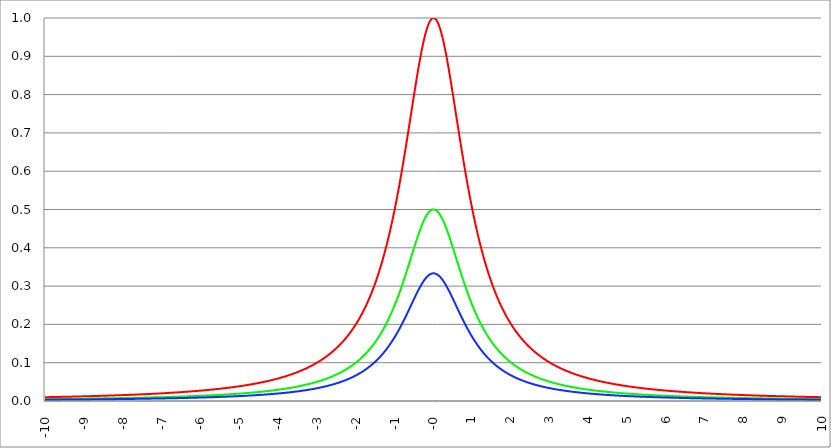
| Category | Series 1 | Series 0 | Series 2 |
|---|---|---|---|
| -10.0 | 0.01 | 0.005 | 0.003 |
| -9.99 | 0.01 | 0.005 | 0.003 |
| -9.98 | 0.01 | 0.005 | 0.003 |
| -9.97 | 0.01 | 0.005 | 0.003 |
| -9.96 | 0.01 | 0.005 | 0.003 |
| -9.95 | 0.01 | 0.005 | 0.003 |
| -9.940000000000001 | 0.01 | 0.005 | 0.003 |
| -9.930000000000001 | 0.01 | 0.005 | 0.003 |
| -9.920000000000002 | 0.01 | 0.005 | 0.003 |
| -9.91 | 0.01 | 0.005 | 0.003 |
| -9.900000000000002 | 0.01 | 0.005 | 0.003 |
| -9.890000000000002 | 0.01 | 0.005 | 0.003 |
| -9.880000000000003 | 0.01 | 0.005 | 0.003 |
| -9.870000000000003 | 0.01 | 0.005 | 0.003 |
| -9.860000000000001 | 0.01 | 0.005 | 0.003 |
| -9.850000000000003 | 0.01 | 0.005 | 0.003 |
| -9.840000000000003 | 0.01 | 0.005 | 0.003 |
| -9.830000000000004 | 0.01 | 0.005 | 0.003 |
| -9.820000000000004 | 0.01 | 0.005 | 0.003 |
| -9.810000000000004 | 0.01 | 0.005 | 0.003 |
| -9.800000000000004 | 0.01 | 0.005 | 0.003 |
| -9.790000000000004 | 0.01 | 0.005 | 0.003 |
| -9.780000000000005 | 0.01 | 0.005 | 0.003 |
| -9.770000000000005 | 0.01 | 0.005 | 0.003 |
| -9.760000000000005 | 0.01 | 0.005 | 0.003 |
| -9.750000000000005 | 0.01 | 0.005 | 0.003 |
| -9.740000000000006 | 0.01 | 0.005 | 0.003 |
| -9.730000000000006 | 0.01 | 0.005 | 0.003 |
| -9.720000000000006 | 0.01 | 0.005 | 0.003 |
| -9.710000000000006 | 0.01 | 0.005 | 0.003 |
| -9.700000000000006 | 0.011 | 0.005 | 0.004 |
| -9.690000000000007 | 0.011 | 0.005 | 0.004 |
| -9.680000000000007 | 0.011 | 0.005 | 0.004 |
| -9.670000000000007 | 0.011 | 0.005 | 0.004 |
| -9.660000000000007 | 0.011 | 0.005 | 0.004 |
| -9.650000000000007 | 0.011 | 0.005 | 0.004 |
| -9.640000000000008 | 0.011 | 0.005 | 0.004 |
| -9.630000000000008 | 0.011 | 0.005 | 0.004 |
| -9.620000000000008 | 0.011 | 0.005 | 0.004 |
| -9.610000000000008 | 0.011 | 0.005 | 0.004 |
| -9.600000000000009 | 0.011 | 0.005 | 0.004 |
| -9.590000000000009 | 0.011 | 0.005 | 0.004 |
| -9.580000000000007 | 0.011 | 0.005 | 0.004 |
| -9.57000000000001 | 0.011 | 0.005 | 0.004 |
| -9.56000000000001 | 0.011 | 0.005 | 0.004 |
| -9.55000000000001 | 0.011 | 0.005 | 0.004 |
| -9.54000000000001 | 0.011 | 0.005 | 0.004 |
| -9.53000000000001 | 0.011 | 0.005 | 0.004 |
| -9.52000000000001 | 0.011 | 0.005 | 0.004 |
| -9.51000000000001 | 0.011 | 0.005 | 0.004 |
| -9.50000000000001 | 0.011 | 0.005 | 0.004 |
| -9.49000000000001 | 0.011 | 0.005 | 0.004 |
| -9.48000000000001 | 0.011 | 0.006 | 0.004 |
| -9.47000000000001 | 0.011 | 0.006 | 0.004 |
| -9.46000000000001 | 0.011 | 0.006 | 0.004 |
| -9.45000000000001 | 0.011 | 0.006 | 0.004 |
| -9.44000000000001 | 0.011 | 0.006 | 0.004 |
| -9.430000000000012 | 0.011 | 0.006 | 0.004 |
| -9.420000000000012 | 0.011 | 0.006 | 0.004 |
| -9.410000000000013 | 0.011 | 0.006 | 0.004 |
| -9.400000000000013 | 0.011 | 0.006 | 0.004 |
| -9.390000000000011 | 0.011 | 0.006 | 0.004 |
| -9.380000000000013 | 0.011 | 0.006 | 0.004 |
| -9.370000000000013 | 0.011 | 0.006 | 0.004 |
| -9.360000000000014 | 0.011 | 0.006 | 0.004 |
| -9.350000000000014 | 0.011 | 0.006 | 0.004 |
| -9.340000000000014 | 0.011 | 0.006 | 0.004 |
| -9.330000000000014 | 0.011 | 0.006 | 0.004 |
| -9.320000000000014 | 0.011 | 0.006 | 0.004 |
| -9.310000000000015 | 0.011 | 0.006 | 0.004 |
| -9.300000000000013 | 0.011 | 0.006 | 0.004 |
| -9.290000000000015 | 0.011 | 0.006 | 0.004 |
| -9.280000000000015 | 0.011 | 0.006 | 0.004 |
| -9.270000000000016 | 0.012 | 0.006 | 0.004 |
| -9.260000000000016 | 0.012 | 0.006 | 0.004 |
| -9.250000000000014 | 0.012 | 0.006 | 0.004 |
| -9.240000000000016 | 0.012 | 0.006 | 0.004 |
| -9.230000000000016 | 0.012 | 0.006 | 0.004 |
| -9.220000000000017 | 0.012 | 0.006 | 0.004 |
| -9.210000000000017 | 0.012 | 0.006 | 0.004 |
| -9.200000000000017 | 0.012 | 0.006 | 0.004 |
| -9.190000000000017 | 0.012 | 0.006 | 0.004 |
| -9.180000000000017 | 0.012 | 0.006 | 0.004 |
| -9.170000000000018 | 0.012 | 0.006 | 0.004 |
| -9.160000000000016 | 0.012 | 0.006 | 0.004 |
| -9.150000000000018 | 0.012 | 0.006 | 0.004 |
| -9.140000000000018 | 0.012 | 0.006 | 0.004 |
| -9.130000000000019 | 0.012 | 0.006 | 0.004 |
| -9.120000000000019 | 0.012 | 0.006 | 0.004 |
| -9.110000000000017 | 0.012 | 0.006 | 0.004 |
| -9.10000000000002 | 0.012 | 0.006 | 0.004 |
| -9.09000000000002 | 0.012 | 0.006 | 0.004 |
| -9.08000000000002 | 0.012 | 0.006 | 0.004 |
| -9.07000000000002 | 0.012 | 0.006 | 0.004 |
| -9.06000000000002 | 0.012 | 0.006 | 0.004 |
| -9.05000000000002 | 0.012 | 0.006 | 0.004 |
| -9.04000000000002 | 0.012 | 0.006 | 0.004 |
| -9.03000000000002 | 0.012 | 0.006 | 0.004 |
| -9.020000000000021 | 0.012 | 0.006 | 0.004 |
| -9.010000000000021 | 0.012 | 0.006 | 0.004 |
| -9.000000000000021 | 0.012 | 0.006 | 0.004 |
| -8.990000000000022 | 0.012 | 0.006 | 0.004 |
| -8.980000000000022 | 0.012 | 0.006 | 0.004 |
| -8.97000000000002 | 0.012 | 0.006 | 0.004 |
| -8.960000000000022 | 0.012 | 0.006 | 0.004 |
| -8.950000000000022 | 0.012 | 0.006 | 0.004 |
| -8.940000000000023 | 0.012 | 0.006 | 0.004 |
| -8.930000000000023 | 0.012 | 0.006 | 0.004 |
| -8.920000000000023 | 0.012 | 0.006 | 0.004 |
| -8.910000000000023 | 0.012 | 0.006 | 0.004 |
| -8.900000000000023 | 0.012 | 0.006 | 0.004 |
| -8.890000000000024 | 0.012 | 0.006 | 0.004 |
| -8.880000000000024 | 0.013 | 0.006 | 0.004 |
| -8.870000000000024 | 0.013 | 0.006 | 0.004 |
| -8.860000000000024 | 0.013 | 0.006 | 0.004 |
| -8.850000000000025 | 0.013 | 0.006 | 0.004 |
| -8.840000000000025 | 0.013 | 0.006 | 0.004 |
| -8.830000000000025 | 0.013 | 0.006 | 0.004 |
| -8.820000000000025 | 0.013 | 0.006 | 0.004 |
| -8.810000000000025 | 0.013 | 0.006 | 0.004 |
| -8.800000000000026 | 0.013 | 0.006 | 0.004 |
| -8.790000000000026 | 0.013 | 0.006 | 0.004 |
| -8.780000000000026 | 0.013 | 0.006 | 0.004 |
| -8.770000000000026 | 0.013 | 0.006 | 0.004 |
| -8.760000000000026 | 0.013 | 0.006 | 0.004 |
| -8.750000000000027 | 0.013 | 0.006 | 0.004 |
| -8.740000000000027 | 0.013 | 0.006 | 0.004 |
| -8.730000000000027 | 0.013 | 0.006 | 0.004 |
| -8.720000000000027 | 0.013 | 0.006 | 0.004 |
| -8.710000000000027 | 0.013 | 0.007 | 0.004 |
| -8.700000000000028 | 0.013 | 0.007 | 0.004 |
| -8.690000000000028 | 0.013 | 0.007 | 0.004 |
| -8.680000000000028 | 0.013 | 0.007 | 0.004 |
| -8.670000000000028 | 0.013 | 0.007 | 0.004 |
| -8.660000000000029 | 0.013 | 0.007 | 0.004 |
| -8.650000000000029 | 0.013 | 0.007 | 0.004 |
| -8.640000000000029 | 0.013 | 0.007 | 0.004 |
| -8.63000000000003 | 0.013 | 0.007 | 0.004 |
| -8.62000000000003 | 0.013 | 0.007 | 0.004 |
| -8.61000000000003 | 0.013 | 0.007 | 0.004 |
| -8.60000000000003 | 0.013 | 0.007 | 0.004 |
| -8.59000000000003 | 0.013 | 0.007 | 0.004 |
| -8.58000000000003 | 0.013 | 0.007 | 0.004 |
| -8.57000000000003 | 0.013 | 0.007 | 0.004 |
| -8.56000000000003 | 0.013 | 0.007 | 0.004 |
| -8.55000000000003 | 0.013 | 0.007 | 0.004 |
| -8.540000000000031 | 0.014 | 0.007 | 0.005 |
| -8.530000000000031 | 0.014 | 0.007 | 0.005 |
| -8.520000000000032 | 0.014 | 0.007 | 0.005 |
| -8.510000000000032 | 0.014 | 0.007 | 0.005 |
| -8.50000000000003 | 0.014 | 0.007 | 0.005 |
| -8.490000000000032 | 0.014 | 0.007 | 0.005 |
| -8.480000000000032 | 0.014 | 0.007 | 0.005 |
| -8.470000000000033 | 0.014 | 0.007 | 0.005 |
| -8.460000000000033 | 0.014 | 0.007 | 0.005 |
| -8.450000000000033 | 0.014 | 0.007 | 0.005 |
| -8.440000000000033 | 0.014 | 0.007 | 0.005 |
| -8.430000000000033 | 0.014 | 0.007 | 0.005 |
| -8.420000000000034 | 0.014 | 0.007 | 0.005 |
| -8.410000000000032 | 0.014 | 0.007 | 0.005 |
| -8.400000000000034 | 0.014 | 0.007 | 0.005 |
| -8.390000000000034 | 0.014 | 0.007 | 0.005 |
| -8.380000000000035 | 0.014 | 0.007 | 0.005 |
| -8.370000000000035 | 0.014 | 0.007 | 0.005 |
| -8.360000000000033 | 0.014 | 0.007 | 0.005 |
| -8.350000000000035 | 0.014 | 0.007 | 0.005 |
| -8.340000000000035 | 0.014 | 0.007 | 0.005 |
| -8.330000000000036 | 0.014 | 0.007 | 0.005 |
| -8.320000000000036 | 0.014 | 0.007 | 0.005 |
| -8.310000000000034 | 0.014 | 0.007 | 0.005 |
| -8.300000000000036 | 0.014 | 0.007 | 0.005 |
| -8.290000000000036 | 0.014 | 0.007 | 0.005 |
| -8.280000000000037 | 0.014 | 0.007 | 0.005 |
| -8.270000000000037 | 0.014 | 0.007 | 0.005 |
| -8.260000000000037 | 0.014 | 0.007 | 0.005 |
| -8.250000000000037 | 0.014 | 0.007 | 0.005 |
| -8.240000000000038 | 0.015 | 0.007 | 0.005 |
| -8.230000000000038 | 0.015 | 0.007 | 0.005 |
| -8.220000000000038 | 0.015 | 0.007 | 0.005 |
| -8.210000000000038 | 0.015 | 0.007 | 0.005 |
| -8.200000000000038 | 0.015 | 0.007 | 0.005 |
| -8.190000000000039 | 0.015 | 0.007 | 0.005 |
| -8.180000000000039 | 0.015 | 0.007 | 0.005 |
| -8.170000000000037 | 0.015 | 0.007 | 0.005 |
| -8.16000000000004 | 0.015 | 0.007 | 0.005 |
| -8.15000000000004 | 0.015 | 0.007 | 0.005 |
| -8.14000000000004 | 0.015 | 0.007 | 0.005 |
| -8.13000000000004 | 0.015 | 0.007 | 0.005 |
| -8.12000000000004 | 0.015 | 0.007 | 0.005 |
| -8.11000000000004 | 0.015 | 0.007 | 0.005 |
| -8.10000000000004 | 0.015 | 0.008 | 0.005 |
| -8.09000000000004 | 0.015 | 0.008 | 0.005 |
| -8.08000000000004 | 0.015 | 0.008 | 0.005 |
| -8.07000000000004 | 0.015 | 0.008 | 0.005 |
| -8.06000000000004 | 0.015 | 0.008 | 0.005 |
| -8.05000000000004 | 0.015 | 0.008 | 0.005 |
| -8.040000000000042 | 0.015 | 0.008 | 0.005 |
| -8.03000000000004 | 0.015 | 0.008 | 0.005 |
| -8.020000000000042 | 0.015 | 0.008 | 0.005 |
| -8.010000000000042 | 0.015 | 0.008 | 0.005 |
| -8.000000000000043 | 0.015 | 0.008 | 0.005 |
| -7.990000000000043 | 0.015 | 0.008 | 0.005 |
| -7.980000000000043 | 0.015 | 0.008 | 0.005 |
| -7.970000000000043 | 0.015 | 0.008 | 0.005 |
| -7.960000000000043 | 0.016 | 0.008 | 0.005 |
| -7.950000000000044 | 0.016 | 0.008 | 0.005 |
| -7.940000000000044 | 0.016 | 0.008 | 0.005 |
| -7.930000000000044 | 0.016 | 0.008 | 0.005 |
| -7.920000000000044 | 0.016 | 0.008 | 0.005 |
| -7.910000000000044 | 0.016 | 0.008 | 0.005 |
| -7.900000000000044 | 0.016 | 0.008 | 0.005 |
| -7.890000000000045 | 0.016 | 0.008 | 0.005 |
| -7.880000000000045 | 0.016 | 0.008 | 0.005 |
| -7.870000000000045 | 0.016 | 0.008 | 0.005 |
| -7.860000000000046 | 0.016 | 0.008 | 0.005 |
| -7.850000000000046 | 0.016 | 0.008 | 0.005 |
| -7.840000000000046 | 0.016 | 0.008 | 0.005 |
| -7.830000000000046 | 0.016 | 0.008 | 0.005 |
| -7.820000000000046 | 0.016 | 0.008 | 0.005 |
| -7.810000000000047 | 0.016 | 0.008 | 0.005 |
| -7.800000000000047 | 0.016 | 0.008 | 0.005 |
| -7.790000000000047 | 0.016 | 0.008 | 0.005 |
| -7.780000000000047 | 0.016 | 0.008 | 0.005 |
| -7.770000000000047 | 0.016 | 0.008 | 0.005 |
| -7.760000000000048 | 0.016 | 0.008 | 0.005 |
| -7.750000000000048 | 0.016 | 0.008 | 0.005 |
| -7.740000000000048 | 0.016 | 0.008 | 0.005 |
| -7.730000000000048 | 0.016 | 0.008 | 0.005 |
| -7.720000000000049 | 0.017 | 0.008 | 0.006 |
| -7.710000000000049 | 0.017 | 0.008 | 0.006 |
| -7.700000000000049 | 0.017 | 0.008 | 0.006 |
| -7.690000000000049 | 0.017 | 0.008 | 0.006 |
| -7.680000000000049 | 0.017 | 0.008 | 0.006 |
| -7.67000000000005 | 0.017 | 0.008 | 0.006 |
| -7.66000000000005 | 0.017 | 0.008 | 0.006 |
| -7.65000000000005 | 0.017 | 0.008 | 0.006 |
| -7.64000000000005 | 0.017 | 0.008 | 0.006 |
| -7.63000000000005 | 0.017 | 0.008 | 0.006 |
| -7.620000000000051 | 0.017 | 0.008 | 0.006 |
| -7.610000000000051 | 0.017 | 0.008 | 0.006 |
| -7.600000000000051 | 0.017 | 0.009 | 0.006 |
| -7.590000000000051 | 0.017 | 0.009 | 0.006 |
| -7.580000000000052 | 0.017 | 0.009 | 0.006 |
| -7.570000000000052 | 0.017 | 0.009 | 0.006 |
| -7.560000000000052 | 0.017 | 0.009 | 0.006 |
| -7.550000000000052 | 0.017 | 0.009 | 0.006 |
| -7.540000000000052 | 0.017 | 0.009 | 0.006 |
| -7.530000000000053 | 0.017 | 0.009 | 0.006 |
| -7.520000000000053 | 0.017 | 0.009 | 0.006 |
| -7.510000000000053 | 0.017 | 0.009 | 0.006 |
| -7.500000000000053 | 0.017 | 0.009 | 0.006 |
| -7.490000000000053 | 0.018 | 0.009 | 0.006 |
| -7.480000000000054 | 0.018 | 0.009 | 0.006 |
| -7.470000000000054 | 0.018 | 0.009 | 0.006 |
| -7.460000000000054 | 0.018 | 0.009 | 0.006 |
| -7.450000000000054 | 0.018 | 0.009 | 0.006 |
| -7.440000000000054 | 0.018 | 0.009 | 0.006 |
| -7.430000000000054 | 0.018 | 0.009 | 0.006 |
| -7.420000000000055 | 0.018 | 0.009 | 0.006 |
| -7.410000000000055 | 0.018 | 0.009 | 0.006 |
| -7.400000000000055 | 0.018 | 0.009 | 0.006 |
| -7.390000000000056 | 0.018 | 0.009 | 0.006 |
| -7.380000000000056 | 0.018 | 0.009 | 0.006 |
| -7.370000000000056 | 0.018 | 0.009 | 0.006 |
| -7.360000000000056 | 0.018 | 0.009 | 0.006 |
| -7.350000000000056 | 0.018 | 0.009 | 0.006 |
| -7.340000000000057 | 0.018 | 0.009 | 0.006 |
| -7.330000000000057 | 0.018 | 0.009 | 0.006 |
| -7.320000000000057 | 0.018 | 0.009 | 0.006 |
| -7.310000000000057 | 0.018 | 0.009 | 0.006 |
| -7.300000000000058 | 0.018 | 0.009 | 0.006 |
| -7.290000000000058 | 0.018 | 0.009 | 0.006 |
| -7.280000000000058 | 0.019 | 0.009 | 0.006 |
| -7.270000000000058 | 0.019 | 0.009 | 0.006 |
| -7.260000000000058 | 0.019 | 0.009 | 0.006 |
| -7.250000000000059 | 0.019 | 0.009 | 0.006 |
| -7.240000000000059 | 0.019 | 0.009 | 0.006 |
| -7.23000000000006 | 0.019 | 0.009 | 0.006 |
| -7.220000000000059 | 0.019 | 0.009 | 0.006 |
| -7.210000000000059 | 0.019 | 0.009 | 0.006 |
| -7.20000000000006 | 0.019 | 0.009 | 0.006 |
| -7.19000000000006 | 0.019 | 0.009 | 0.006 |
| -7.18000000000006 | 0.019 | 0.01 | 0.006 |
| -7.17000000000006 | 0.019 | 0.01 | 0.006 |
| -7.160000000000061 | 0.019 | 0.01 | 0.006 |
| -7.150000000000061 | 0.019 | 0.01 | 0.006 |
| -7.140000000000061 | 0.019 | 0.01 | 0.006 |
| -7.130000000000061 | 0.019 | 0.01 | 0.006 |
| -7.120000000000061 | 0.019 | 0.01 | 0.006 |
| -7.110000000000062 | 0.019 | 0.01 | 0.006 |
| -7.100000000000062 | 0.019 | 0.01 | 0.006 |
| -7.090000000000062 | 0.02 | 0.01 | 0.007 |
| -7.080000000000062 | 0.02 | 0.01 | 0.007 |
| -7.070000000000062 | 0.02 | 0.01 | 0.007 |
| -7.060000000000063 | 0.02 | 0.01 | 0.007 |
| -7.050000000000063 | 0.02 | 0.01 | 0.007 |
| -7.040000000000063 | 0.02 | 0.01 | 0.007 |
| -7.030000000000063 | 0.02 | 0.01 | 0.007 |
| -7.020000000000064 | 0.02 | 0.01 | 0.007 |
| -7.010000000000064 | 0.02 | 0.01 | 0.007 |
| -7.000000000000064 | 0.02 | 0.01 | 0.007 |
| -6.990000000000064 | 0.02 | 0.01 | 0.007 |
| -6.980000000000064 | 0.02 | 0.01 | 0.007 |
| -6.970000000000064 | 0.02 | 0.01 | 0.007 |
| -6.960000000000064 | 0.02 | 0.01 | 0.007 |
| -6.950000000000064 | 0.02 | 0.01 | 0.007 |
| -6.940000000000065 | 0.02 | 0.01 | 0.007 |
| -6.930000000000065 | 0.02 | 0.01 | 0.007 |
| -6.920000000000065 | 0.02 | 0.01 | 0.007 |
| -6.910000000000065 | 0.021 | 0.01 | 0.007 |
| -6.900000000000066 | 0.021 | 0.01 | 0.007 |
| -6.890000000000066 | 0.021 | 0.01 | 0.007 |
| -6.880000000000066 | 0.021 | 0.01 | 0.007 |
| -6.870000000000066 | 0.021 | 0.01 | 0.007 |
| -6.860000000000067 | 0.021 | 0.01 | 0.007 |
| -6.850000000000067 | 0.021 | 0.01 | 0.007 |
| -6.840000000000067 | 0.021 | 0.01 | 0.007 |
| -6.830000000000067 | 0.021 | 0.01 | 0.007 |
| -6.820000000000068 | 0.021 | 0.011 | 0.007 |
| -6.810000000000068 | 0.021 | 0.011 | 0.007 |
| -6.800000000000068 | 0.021 | 0.011 | 0.007 |
| -6.790000000000068 | 0.021 | 0.011 | 0.007 |
| -6.780000000000068 | 0.021 | 0.011 | 0.007 |
| -6.770000000000068 | 0.021 | 0.011 | 0.007 |
| -6.760000000000069 | 0.021 | 0.011 | 0.007 |
| -6.75000000000007 | 0.021 | 0.011 | 0.007 |
| -6.74000000000007 | 0.022 | 0.011 | 0.007 |
| -6.73000000000007 | 0.022 | 0.011 | 0.007 |
| -6.72000000000007 | 0.022 | 0.011 | 0.007 |
| -6.71000000000007 | 0.022 | 0.011 | 0.007 |
| -6.70000000000007 | 0.022 | 0.011 | 0.007 |
| -6.69000000000007 | 0.022 | 0.011 | 0.007 |
| -6.680000000000071 | 0.022 | 0.011 | 0.007 |
| -6.670000000000071 | 0.022 | 0.011 | 0.007 |
| -6.660000000000071 | 0.022 | 0.011 | 0.007 |
| -6.650000000000071 | 0.022 | 0.011 | 0.007 |
| -6.640000000000072 | 0.022 | 0.011 | 0.007 |
| -6.630000000000072 | 0.022 | 0.011 | 0.007 |
| -6.620000000000072 | 0.022 | 0.011 | 0.007 |
| -6.610000000000072 | 0.022 | 0.011 | 0.007 |
| -6.600000000000072 | 0.022 | 0.011 | 0.007 |
| -6.590000000000073 | 0.023 | 0.011 | 0.008 |
| -6.580000000000073 | 0.023 | 0.011 | 0.008 |
| -6.570000000000073 | 0.023 | 0.011 | 0.008 |
| -6.560000000000073 | 0.023 | 0.011 | 0.008 |
| -6.550000000000074 | 0.023 | 0.011 | 0.008 |
| -6.540000000000074 | 0.023 | 0.011 | 0.008 |
| -6.530000000000074 | 0.023 | 0.011 | 0.008 |
| -6.520000000000074 | 0.023 | 0.011 | 0.008 |
| -6.510000000000074 | 0.023 | 0.012 | 0.008 |
| -6.500000000000074 | 0.023 | 0.012 | 0.008 |
| -6.490000000000074 | 0.023 | 0.012 | 0.008 |
| -6.480000000000074 | 0.023 | 0.012 | 0.008 |
| -6.470000000000075 | 0.023 | 0.012 | 0.008 |
| -6.460000000000075 | 0.023 | 0.012 | 0.008 |
| -6.450000000000075 | 0.023 | 0.012 | 0.008 |
| -6.440000000000075 | 0.024 | 0.012 | 0.008 |
| -6.430000000000076 | 0.024 | 0.012 | 0.008 |
| -6.420000000000076 | 0.024 | 0.012 | 0.008 |
| -6.410000000000076 | 0.024 | 0.012 | 0.008 |
| -6.400000000000076 | 0.024 | 0.012 | 0.008 |
| -6.390000000000077 | 0.024 | 0.012 | 0.008 |
| -6.380000000000077 | 0.024 | 0.012 | 0.008 |
| -6.370000000000077 | 0.024 | 0.012 | 0.008 |
| -6.360000000000078 | 0.024 | 0.012 | 0.008 |
| -6.350000000000078 | 0.024 | 0.012 | 0.008 |
| -6.340000000000078 | 0.024 | 0.012 | 0.008 |
| -6.330000000000078 | 0.024 | 0.012 | 0.008 |
| -6.320000000000078 | 0.024 | 0.012 | 0.008 |
| -6.310000000000079 | 0.025 | 0.012 | 0.008 |
| -6.300000000000079 | 0.025 | 0.012 | 0.008 |
| -6.29000000000008 | 0.025 | 0.012 | 0.008 |
| -6.28000000000008 | 0.025 | 0.012 | 0.008 |
| -6.27000000000008 | 0.025 | 0.012 | 0.008 |
| -6.26000000000008 | 0.025 | 0.012 | 0.008 |
| -6.25000000000008 | 0.025 | 0.012 | 0.008 |
| -6.24000000000008 | 0.025 | 0.013 | 0.008 |
| -6.23000000000008 | 0.025 | 0.013 | 0.008 |
| -6.220000000000081 | 0.025 | 0.013 | 0.008 |
| -6.210000000000081 | 0.025 | 0.013 | 0.008 |
| -6.200000000000081 | 0.025 | 0.013 | 0.008 |
| -6.190000000000081 | 0.025 | 0.013 | 0.008 |
| -6.180000000000081 | 0.026 | 0.013 | 0.009 |
| -6.170000000000082 | 0.026 | 0.013 | 0.009 |
| -6.160000000000082 | 0.026 | 0.013 | 0.009 |
| -6.150000000000082 | 0.026 | 0.013 | 0.009 |
| -6.140000000000082 | 0.026 | 0.013 | 0.009 |
| -6.130000000000082 | 0.026 | 0.013 | 0.009 |
| -6.120000000000083 | 0.026 | 0.013 | 0.009 |
| -6.110000000000083 | 0.026 | 0.013 | 0.009 |
| -6.100000000000083 | 0.026 | 0.013 | 0.009 |
| -6.090000000000083 | 0.026 | 0.013 | 0.009 |
| -6.080000000000084 | 0.026 | 0.013 | 0.009 |
| -6.070000000000084 | 0.026 | 0.013 | 0.009 |
| -6.060000000000084 | 0.027 | 0.013 | 0.009 |
| -6.050000000000084 | 0.027 | 0.013 | 0.009 |
| -6.040000000000084 | 0.027 | 0.013 | 0.009 |
| -6.030000000000084 | 0.027 | 0.013 | 0.009 |
| -6.020000000000085 | 0.027 | 0.013 | 0.009 |
| -6.010000000000085 | 0.027 | 0.013 | 0.009 |
| -6.000000000000085 | 0.027 | 0.014 | 0.009 |
| -5.990000000000085 | 0.027 | 0.014 | 0.009 |
| -5.980000000000085 | 0.027 | 0.014 | 0.009 |
| -5.970000000000085 | 0.027 | 0.014 | 0.009 |
| -5.960000000000086 | 0.027 | 0.014 | 0.009 |
| -5.950000000000086 | 0.027 | 0.014 | 0.009 |
| -5.940000000000086 | 0.028 | 0.014 | 0.009 |
| -5.930000000000086 | 0.028 | 0.014 | 0.009 |
| -5.920000000000087 | 0.028 | 0.014 | 0.009 |
| -5.910000000000087 | 0.028 | 0.014 | 0.009 |
| -5.900000000000087 | 0.028 | 0.014 | 0.009 |
| -5.890000000000088 | 0.028 | 0.014 | 0.009 |
| -5.880000000000088 | 0.028 | 0.014 | 0.009 |
| -5.870000000000088 | 0.028 | 0.014 | 0.009 |
| -5.860000000000088 | 0.028 | 0.014 | 0.009 |
| -5.850000000000088 | 0.028 | 0.014 | 0.009 |
| -5.840000000000089 | 0.028 | 0.014 | 0.009 |
| -5.830000000000089 | 0.029 | 0.014 | 0.01 |
| -5.820000000000089 | 0.029 | 0.014 | 0.01 |
| -5.810000000000089 | 0.029 | 0.014 | 0.01 |
| -5.800000000000089 | 0.029 | 0.014 | 0.01 |
| -5.79000000000009 | 0.029 | 0.014 | 0.01 |
| -5.78000000000009 | 0.029 | 0.015 | 0.01 |
| -5.77000000000009 | 0.029 | 0.015 | 0.01 |
| -5.76000000000009 | 0.029 | 0.015 | 0.01 |
| -5.750000000000091 | 0.029 | 0.015 | 0.01 |
| -5.740000000000091 | 0.029 | 0.015 | 0.01 |
| -5.730000000000091 | 0.03 | 0.015 | 0.01 |
| -5.720000000000091 | 0.03 | 0.015 | 0.01 |
| -5.710000000000091 | 0.03 | 0.015 | 0.01 |
| -5.700000000000092 | 0.03 | 0.015 | 0.01 |
| -5.690000000000092 | 0.03 | 0.015 | 0.01 |
| -5.680000000000092 | 0.03 | 0.015 | 0.01 |
| -5.670000000000092 | 0.03 | 0.015 | 0.01 |
| -5.660000000000092 | 0.03 | 0.015 | 0.01 |
| -5.650000000000093 | 0.03 | 0.015 | 0.01 |
| -5.640000000000093 | 0.03 | 0.015 | 0.01 |
| -5.630000000000093 | 0.031 | 0.015 | 0.01 |
| -5.620000000000093 | 0.031 | 0.015 | 0.01 |
| -5.610000000000093 | 0.031 | 0.015 | 0.01 |
| -5.600000000000094 | 0.031 | 0.015 | 0.01 |
| -5.590000000000094 | 0.031 | 0.016 | 0.01 |
| -5.580000000000094 | 0.031 | 0.016 | 0.01 |
| -5.570000000000094 | 0.031 | 0.016 | 0.01 |
| -5.560000000000095 | 0.031 | 0.016 | 0.01 |
| -5.550000000000095 | 0.031 | 0.016 | 0.01 |
| -5.540000000000095 | 0.032 | 0.016 | 0.011 |
| -5.530000000000095 | 0.032 | 0.016 | 0.011 |
| -5.520000000000095 | 0.032 | 0.016 | 0.011 |
| -5.510000000000096 | 0.032 | 0.016 | 0.011 |
| -5.500000000000096 | 0.032 | 0.016 | 0.011 |
| -5.490000000000096 | 0.032 | 0.016 | 0.011 |
| -5.480000000000096 | 0.032 | 0.016 | 0.011 |
| -5.470000000000096 | 0.032 | 0.016 | 0.011 |
| -5.460000000000097 | 0.032 | 0.016 | 0.011 |
| -5.450000000000097 | 0.033 | 0.016 | 0.011 |
| -5.440000000000097 | 0.033 | 0.016 | 0.011 |
| -5.430000000000097 | 0.033 | 0.016 | 0.011 |
| -5.420000000000098 | 0.033 | 0.016 | 0.011 |
| -5.410000000000098 | 0.033 | 0.017 | 0.011 |
| -5.400000000000098 | 0.033 | 0.017 | 0.011 |
| -5.390000000000098 | 0.033 | 0.017 | 0.011 |
| -5.380000000000098 | 0.033 | 0.017 | 0.011 |
| -5.370000000000099 | 0.034 | 0.017 | 0.011 |
| -5.360000000000099 | 0.034 | 0.017 | 0.011 |
| -5.350000000000099 | 0.034 | 0.017 | 0.011 |
| -5.340000000000099 | 0.034 | 0.017 | 0.011 |
| -5.330000000000099 | 0.034 | 0.017 | 0.011 |
| -5.3200000000001 | 0.034 | 0.017 | 0.011 |
| -5.3100000000001 | 0.034 | 0.017 | 0.011 |
| -5.3000000000001 | 0.034 | 0.017 | 0.011 |
| -5.2900000000001 | 0.035 | 0.017 | 0.012 |
| -5.2800000000001 | 0.035 | 0.017 | 0.012 |
| -5.2700000000001 | 0.035 | 0.017 | 0.012 |
| -5.260000000000101 | 0.035 | 0.017 | 0.012 |
| -5.250000000000101 | 0.035 | 0.018 | 0.012 |
| -5.240000000000101 | 0.035 | 0.018 | 0.012 |
| -5.230000000000101 | 0.035 | 0.018 | 0.012 |
| -5.220000000000102 | 0.035 | 0.018 | 0.012 |
| -5.210000000000102 | 0.036 | 0.018 | 0.012 |
| -5.200000000000102 | 0.036 | 0.018 | 0.012 |
| -5.190000000000103 | 0.036 | 0.018 | 0.012 |
| -5.180000000000103 | 0.036 | 0.018 | 0.012 |
| -5.170000000000103 | 0.036 | 0.018 | 0.012 |
| -5.160000000000103 | 0.036 | 0.018 | 0.012 |
| -5.150000000000103 | 0.036 | 0.018 | 0.012 |
| -5.140000000000104 | 0.036 | 0.018 | 0.012 |
| -5.130000000000104 | 0.037 | 0.018 | 0.012 |
| -5.120000000000104 | 0.037 | 0.018 | 0.012 |
| -5.110000000000104 | 0.037 | 0.018 | 0.012 |
| -5.100000000000104 | 0.037 | 0.019 | 0.012 |
| -5.090000000000104 | 0.037 | 0.019 | 0.012 |
| -5.080000000000104 | 0.037 | 0.019 | 0.012 |
| -5.070000000000105 | 0.037 | 0.019 | 0.012 |
| -5.060000000000105 | 0.038 | 0.019 | 0.013 |
| -5.050000000000105 | 0.038 | 0.019 | 0.013 |
| -5.040000000000105 | 0.038 | 0.019 | 0.013 |
| -5.030000000000105 | 0.038 | 0.019 | 0.013 |
| -5.020000000000106 | 0.038 | 0.019 | 0.013 |
| -5.010000000000106 | 0.038 | 0.019 | 0.013 |
| -5.000000000000106 | 0.038 | 0.019 | 0.013 |
| -4.990000000000106 | 0.039 | 0.019 | 0.013 |
| -4.980000000000106 | 0.039 | 0.019 | 0.013 |
| -4.970000000000107 | 0.039 | 0.019 | 0.013 |
| -4.960000000000107 | 0.039 | 0.02 | 0.013 |
| -4.950000000000107 | 0.039 | 0.02 | 0.013 |
| -4.940000000000107 | 0.039 | 0.02 | 0.013 |
| -4.930000000000108 | 0.04 | 0.02 | 0.013 |
| -4.920000000000108 | 0.04 | 0.02 | 0.013 |
| -4.910000000000108 | 0.04 | 0.02 | 0.013 |
| -4.900000000000108 | 0.04 | 0.02 | 0.013 |
| -4.890000000000109 | 0.04 | 0.02 | 0.013 |
| -4.88000000000011 | 0.04 | 0.02 | 0.013 |
| -4.87000000000011 | 0.04 | 0.02 | 0.013 |
| -4.86000000000011 | 0.041 | 0.02 | 0.014 |
| -4.85000000000011 | 0.041 | 0.02 | 0.014 |
| -4.84000000000011 | 0.041 | 0.02 | 0.014 |
| -4.83000000000011 | 0.041 | 0.021 | 0.014 |
| -4.82000000000011 | 0.041 | 0.021 | 0.014 |
| -4.810000000000111 | 0.041 | 0.021 | 0.014 |
| -4.800000000000111 | 0.042 | 0.021 | 0.014 |
| -4.790000000000111 | 0.042 | 0.021 | 0.014 |
| -4.780000000000111 | 0.042 | 0.021 | 0.014 |
| -4.770000000000111 | 0.042 | 0.021 | 0.014 |
| -4.760000000000112 | 0.042 | 0.021 | 0.014 |
| -4.750000000000112 | 0.042 | 0.021 | 0.014 |
| -4.740000000000112 | 0.043 | 0.021 | 0.014 |
| -4.730000000000112 | 0.043 | 0.021 | 0.014 |
| -4.720000000000112 | 0.043 | 0.021 | 0.014 |
| -4.710000000000113 | 0.043 | 0.022 | 0.014 |
| -4.700000000000113 | 0.043 | 0.022 | 0.014 |
| -4.690000000000113 | 0.043 | 0.022 | 0.014 |
| -4.680000000000113 | 0.044 | 0.022 | 0.015 |
| -4.670000000000114 | 0.044 | 0.022 | 0.015 |
| -4.660000000000114 | 0.044 | 0.022 | 0.015 |
| -4.650000000000114 | 0.044 | 0.022 | 0.015 |
| -4.640000000000114 | 0.044 | 0.022 | 0.015 |
| -4.630000000000114 | 0.045 | 0.022 | 0.015 |
| -4.620000000000115 | 0.045 | 0.022 | 0.015 |
| -4.610000000000115 | 0.045 | 0.022 | 0.015 |
| -4.600000000000115 | 0.045 | 0.023 | 0.015 |
| -4.590000000000115 | 0.045 | 0.023 | 0.015 |
| -4.580000000000115 | 0.046 | 0.023 | 0.015 |
| -4.570000000000115 | 0.046 | 0.023 | 0.015 |
| -4.560000000000116 | 0.046 | 0.023 | 0.015 |
| -4.550000000000116 | 0.046 | 0.023 | 0.015 |
| -4.540000000000116 | 0.046 | 0.023 | 0.015 |
| -4.530000000000116 | 0.046 | 0.023 | 0.015 |
| -4.520000000000117 | 0.047 | 0.023 | 0.016 |
| -4.510000000000117 | 0.047 | 0.023 | 0.016 |
| -4.500000000000117 | 0.047 | 0.024 | 0.016 |
| -4.490000000000117 | 0.047 | 0.024 | 0.016 |
| -4.480000000000117 | 0.047 | 0.024 | 0.016 |
| -4.470000000000117 | 0.048 | 0.024 | 0.016 |
| -4.460000000000118 | 0.048 | 0.024 | 0.016 |
| -4.450000000000118 | 0.048 | 0.024 | 0.016 |
| -4.440000000000118 | 0.048 | 0.024 | 0.016 |
| -4.430000000000118 | 0.048 | 0.024 | 0.016 |
| -4.420000000000119 | 0.049 | 0.024 | 0.016 |
| -4.41000000000012 | 0.049 | 0.024 | 0.016 |
| -4.40000000000012 | 0.049 | 0.025 | 0.016 |
| -4.39000000000012 | 0.049 | 0.025 | 0.016 |
| -4.38000000000012 | 0.05 | 0.025 | 0.017 |
| -4.37000000000012 | 0.05 | 0.025 | 0.017 |
| -4.36000000000012 | 0.05 | 0.025 | 0.017 |
| -4.35000000000012 | 0.05 | 0.025 | 0.017 |
| -4.34000000000012 | 0.05 | 0.025 | 0.017 |
| -4.33000000000012 | 0.051 | 0.025 | 0.017 |
| -4.320000000000121 | 0.051 | 0.025 | 0.017 |
| -4.310000000000121 | 0.051 | 0.026 | 0.017 |
| -4.300000000000121 | 0.051 | 0.026 | 0.017 |
| -4.290000000000121 | 0.052 | 0.026 | 0.017 |
| -4.280000000000121 | 0.052 | 0.026 | 0.017 |
| -4.270000000000122 | 0.052 | 0.026 | 0.017 |
| -4.260000000000122 | 0.052 | 0.026 | 0.017 |
| -4.250000000000122 | 0.052 | 0.026 | 0.017 |
| -4.240000000000122 | 0.053 | 0.026 | 0.018 |
| -4.230000000000122 | 0.053 | 0.026 | 0.018 |
| -4.220000000000123 | 0.053 | 0.027 | 0.018 |
| -4.210000000000123 | 0.053 | 0.027 | 0.018 |
| -4.200000000000123 | 0.054 | 0.027 | 0.018 |
| -4.190000000000124 | 0.054 | 0.027 | 0.018 |
| -4.180000000000124 | 0.054 | 0.027 | 0.018 |
| -4.170000000000124 | 0.054 | 0.027 | 0.018 |
| -4.160000000000124 | 0.055 | 0.027 | 0.018 |
| -4.150000000000124 | 0.055 | 0.027 | 0.018 |
| -4.140000000000124 | 0.055 | 0.028 | 0.018 |
| -4.130000000000125 | 0.055 | 0.028 | 0.018 |
| -4.120000000000125 | 0.056 | 0.028 | 0.019 |
| -4.110000000000125 | 0.056 | 0.028 | 0.019 |
| -4.100000000000125 | 0.056 | 0.028 | 0.019 |
| -4.090000000000125 | 0.056 | 0.028 | 0.019 |
| -4.080000000000126 | 0.057 | 0.028 | 0.019 |
| -4.070000000000126 | 0.057 | 0.028 | 0.019 |
| -4.060000000000126 | 0.057 | 0.029 | 0.019 |
| -4.050000000000126 | 0.057 | 0.029 | 0.019 |
| -4.040000000000127 | 0.058 | 0.029 | 0.019 |
| -4.030000000000127 | 0.058 | 0.029 | 0.019 |
| -4.020000000000127 | 0.058 | 0.029 | 0.019 |
| -4.010000000000127 | 0.059 | 0.029 | 0.02 |
| -4.000000000000127 | 0.059 | 0.029 | 0.02 |
| -3.990000000000128 | 0.059 | 0.03 | 0.02 |
| -3.980000000000128 | 0.059 | 0.03 | 0.02 |
| -3.970000000000129 | 0.06 | 0.03 | 0.02 |
| -3.960000000000129 | 0.06 | 0.03 | 0.02 |
| -3.950000000000129 | 0.06 | 0.03 | 0.02 |
| -3.940000000000129 | 0.061 | 0.03 | 0.02 |
| -3.930000000000129 | 0.061 | 0.03 | 0.02 |
| -3.92000000000013 | 0.061 | 0.031 | 0.02 |
| -3.91000000000013 | 0.061 | 0.031 | 0.02 |
| -3.90000000000013 | 0.062 | 0.031 | 0.021 |
| -3.89000000000013 | 0.062 | 0.031 | 0.021 |
| -3.88000000000013 | 0.062 | 0.031 | 0.021 |
| -3.870000000000131 | 0.063 | 0.031 | 0.021 |
| -3.860000000000131 | 0.063 | 0.031 | 0.021 |
| -3.850000000000131 | 0.063 | 0.032 | 0.021 |
| -3.840000000000131 | 0.064 | 0.032 | 0.021 |
| -3.830000000000131 | 0.064 | 0.032 | 0.021 |
| -3.820000000000132 | 0.064 | 0.032 | 0.021 |
| -3.810000000000132 | 0.064 | 0.032 | 0.021 |
| -3.800000000000132 | 0.065 | 0.032 | 0.022 |
| -3.790000000000132 | 0.065 | 0.033 | 0.022 |
| -3.780000000000132 | 0.065 | 0.033 | 0.022 |
| -3.770000000000133 | 0.066 | 0.033 | 0.022 |
| -3.760000000000133 | 0.066 | 0.033 | 0.022 |
| -3.750000000000133 | 0.066 | 0.033 | 0.022 |
| -3.740000000000133 | 0.067 | 0.033 | 0.022 |
| -3.730000000000134 | 0.067 | 0.034 | 0.022 |
| -3.720000000000134 | 0.067 | 0.034 | 0.022 |
| -3.710000000000134 | 0.068 | 0.034 | 0.023 |
| -3.700000000000134 | 0.068 | 0.034 | 0.023 |
| -3.690000000000134 | 0.068 | 0.034 | 0.023 |
| -3.680000000000135 | 0.069 | 0.034 | 0.023 |
| -3.670000000000135 | 0.069 | 0.035 | 0.023 |
| -3.660000000000135 | 0.069 | 0.035 | 0.023 |
| -3.650000000000135 | 0.07 | 0.035 | 0.023 |
| -3.640000000000135 | 0.07 | 0.035 | 0.023 |
| -3.630000000000136 | 0.071 | 0.035 | 0.024 |
| -3.620000000000136 | 0.071 | 0.035 | 0.024 |
| -3.610000000000136 | 0.071 | 0.036 | 0.024 |
| -3.600000000000136 | 0.072 | 0.036 | 0.024 |
| -3.590000000000137 | 0.072 | 0.036 | 0.024 |
| -3.580000000000137 | 0.072 | 0.036 | 0.024 |
| -3.570000000000137 | 0.073 | 0.036 | 0.024 |
| -3.560000000000137 | 0.073 | 0.037 | 0.024 |
| -3.550000000000137 | 0.074 | 0.037 | 0.025 |
| -3.540000000000138 | 0.074 | 0.037 | 0.025 |
| -3.530000000000138 | 0.074 | 0.037 | 0.025 |
| -3.520000000000138 | 0.075 | 0.037 | 0.025 |
| -3.510000000000138 | 0.075 | 0.038 | 0.025 |
| -3.500000000000139 | 0.075 | 0.038 | 0.025 |
| -3.490000000000139 | 0.076 | 0.038 | 0.025 |
| -3.480000000000139 | 0.076 | 0.038 | 0.025 |
| -3.470000000000139 | 0.077 | 0.038 | 0.026 |
| -3.460000000000139 | 0.077 | 0.039 | 0.026 |
| -3.45000000000014 | 0.078 | 0.039 | 0.026 |
| -3.44000000000014 | 0.078 | 0.039 | 0.026 |
| -3.43000000000014 | 0.078 | 0.039 | 0.026 |
| -3.42000000000014 | 0.079 | 0.039 | 0.026 |
| -3.41000000000014 | 0.079 | 0.04 | 0.026 |
| -3.400000000000141 | 0.08 | 0.04 | 0.027 |
| -3.390000000000141 | 0.08 | 0.04 | 0.027 |
| -3.380000000000141 | 0.08 | 0.04 | 0.027 |
| -3.370000000000141 | 0.081 | 0.04 | 0.027 |
| -3.360000000000141 | 0.081 | 0.041 | 0.027 |
| -3.350000000000142 | 0.082 | 0.041 | 0.027 |
| -3.340000000000142 | 0.082 | 0.041 | 0.027 |
| -3.330000000000142 | 0.083 | 0.041 | 0.028 |
| -3.320000000000142 | 0.083 | 0.042 | 0.028 |
| -3.310000000000143 | 0.084 | 0.042 | 0.028 |
| -3.300000000000143 | 0.084 | 0.042 | 0.028 |
| -3.290000000000143 | 0.085 | 0.042 | 0.028 |
| -3.280000000000143 | 0.085 | 0.043 | 0.028 |
| -3.270000000000143 | 0.086 | 0.043 | 0.029 |
| -3.260000000000144 | 0.086 | 0.043 | 0.029 |
| -3.250000000000144 | 0.086 | 0.043 | 0.029 |
| -3.240000000000144 | 0.087 | 0.043 | 0.029 |
| -3.230000000000144 | 0.087 | 0.044 | 0.029 |
| -3.220000000000145 | 0.088 | 0.044 | 0.029 |
| -3.210000000000145 | 0.088 | 0.044 | 0.029 |
| -3.200000000000145 | 0.089 | 0.044 | 0.03 |
| -3.190000000000145 | 0.089 | 0.045 | 0.03 |
| -3.180000000000145 | 0.09 | 0.045 | 0.03 |
| -3.170000000000146 | 0.091 | 0.045 | 0.03 |
| -3.160000000000146 | 0.091 | 0.046 | 0.03 |
| -3.150000000000146 | 0.092 | 0.046 | 0.031 |
| -3.140000000000146 | 0.092 | 0.046 | 0.031 |
| -3.130000000000146 | 0.093 | 0.046 | 0.031 |
| -3.120000000000147 | 0.093 | 0.047 | 0.031 |
| -3.110000000000147 | 0.094 | 0.047 | 0.031 |
| -3.100000000000147 | 0.094 | 0.047 | 0.031 |
| -3.090000000000147 | 0.095 | 0.047 | 0.032 |
| -3.080000000000147 | 0.095 | 0.048 | 0.032 |
| -3.070000000000148 | 0.096 | 0.048 | 0.032 |
| -3.060000000000148 | 0.096 | 0.048 | 0.032 |
| -3.050000000000148 | 0.097 | 0.049 | 0.032 |
| -3.040000000000148 | 0.098 | 0.049 | 0.033 |
| -3.030000000000149 | 0.098 | 0.049 | 0.033 |
| -3.020000000000149 | 0.099 | 0.049 | 0.033 |
| -3.010000000000149 | 0.099 | 0.05 | 0.033 |
| -3.000000000000149 | 0.1 | 0.05 | 0.033 |
| -2.990000000000149 | 0.101 | 0.05 | 0.034 |
| -2.98000000000015 | 0.101 | 0.051 | 0.034 |
| -2.97000000000015 | 0.102 | 0.051 | 0.034 |
| -2.96000000000015 | 0.102 | 0.051 | 0.034 |
| -2.95000000000015 | 0.103 | 0.052 | 0.034 |
| -2.94000000000015 | 0.104 | 0.052 | 0.035 |
| -2.930000000000151 | 0.104 | 0.052 | 0.035 |
| -2.920000000000151 | 0.105 | 0.052 | 0.035 |
| -2.910000000000151 | 0.106 | 0.053 | 0.035 |
| -2.900000000000151 | 0.106 | 0.053 | 0.035 |
| -2.890000000000151 | 0.107 | 0.053 | 0.036 |
| -2.880000000000152 | 0.108 | 0.054 | 0.036 |
| -2.870000000000152 | 0.108 | 0.054 | 0.036 |
| -2.860000000000152 | 0.109 | 0.054 | 0.036 |
| -2.850000000000152 | 0.11 | 0.055 | 0.037 |
| -2.840000000000153 | 0.11 | 0.055 | 0.037 |
| -2.830000000000153 | 0.111 | 0.056 | 0.037 |
| -2.820000000000153 | 0.112 | 0.056 | 0.037 |
| -2.810000000000153 | 0.112 | 0.056 | 0.037 |
| -2.800000000000153 | 0.113 | 0.057 | 0.038 |
| -2.790000000000154 | 0.114 | 0.057 | 0.038 |
| -2.780000000000154 | 0.115 | 0.057 | 0.038 |
| -2.770000000000154 | 0.115 | 0.058 | 0.038 |
| -2.760000000000154 | 0.116 | 0.058 | 0.039 |
| -2.750000000000154 | 0.117 | 0.058 | 0.039 |
| -2.740000000000155 | 0.118 | 0.059 | 0.039 |
| -2.730000000000155 | 0.118 | 0.059 | 0.039 |
| -2.720000000000155 | 0.119 | 0.06 | 0.04 |
| -2.710000000000155 | 0.12 | 0.06 | 0.04 |
| -2.700000000000156 | 0.121 | 0.06 | 0.04 |
| -2.690000000000156 | 0.121 | 0.061 | 0.04 |
| -2.680000000000156 | 0.122 | 0.061 | 0.041 |
| -2.670000000000156 | 0.123 | 0.062 | 0.041 |
| -2.660000000000156 | 0.124 | 0.062 | 0.041 |
| -2.650000000000157 | 0.125 | 0.062 | 0.042 |
| -2.640000000000157 | 0.125 | 0.063 | 0.042 |
| -2.630000000000157 | 0.126 | 0.063 | 0.042 |
| -2.620000000000157 | 0.127 | 0.064 | 0.042 |
| -2.610000000000157 | 0.128 | 0.064 | 0.043 |
| -2.600000000000158 | 0.129 | 0.064 | 0.043 |
| -2.590000000000158 | 0.13 | 0.065 | 0.043 |
| -2.580000000000158 | 0.131 | 0.065 | 0.044 |
| -2.570000000000158 | 0.131 | 0.066 | 0.044 |
| -2.560000000000159 | 0.132 | 0.066 | 0.044 |
| -2.550000000000159 | 0.133 | 0.067 | 0.044 |
| -2.54000000000016 | 0.134 | 0.067 | 0.045 |
| -2.530000000000159 | 0.135 | 0.068 | 0.045 |
| -2.520000000000159 | 0.136 | 0.068 | 0.045 |
| -2.51000000000016 | 0.137 | 0.068 | 0.046 |
| -2.50000000000016 | 0.138 | 0.069 | 0.046 |
| -2.49000000000016 | 0.139 | 0.069 | 0.046 |
| -2.48000000000016 | 0.14 | 0.07 | 0.047 |
| -2.47000000000016 | 0.141 | 0.07 | 0.047 |
| -2.460000000000161 | 0.142 | 0.071 | 0.047 |
| -2.450000000000161 | 0.143 | 0.071 | 0.048 |
| -2.440000000000161 | 0.144 | 0.072 | 0.048 |
| -2.430000000000161 | 0.145 | 0.072 | 0.048 |
| -2.420000000000162 | 0.146 | 0.073 | 0.049 |
| -2.410000000000162 | 0.147 | 0.073 | 0.049 |
| -2.400000000000162 | 0.148 | 0.074 | 0.049 |
| -2.390000000000162 | 0.149 | 0.074 | 0.05 |
| -2.380000000000162 | 0.15 | 0.075 | 0.05 |
| -2.370000000000163 | 0.151 | 0.076 | 0.05 |
| -2.360000000000163 | 0.152 | 0.076 | 0.051 |
| -2.350000000000163 | 0.153 | 0.077 | 0.051 |
| -2.340000000000163 | 0.154 | 0.077 | 0.051 |
| -2.330000000000163 | 0.156 | 0.078 | 0.052 |
| -2.320000000000164 | 0.157 | 0.078 | 0.052 |
| -2.310000000000164 | 0.158 | 0.079 | 0.053 |
| -2.300000000000164 | 0.159 | 0.079 | 0.053 |
| -2.290000000000164 | 0.16 | 0.08 | 0.053 |
| -2.280000000000165 | 0.161 | 0.081 | 0.054 |
| -2.270000000000165 | 0.163 | 0.081 | 0.054 |
| -2.260000000000165 | 0.164 | 0.082 | 0.055 |
| -2.250000000000165 | 0.165 | 0.082 | 0.055 |
| -2.240000000000165 | 0.166 | 0.083 | 0.055 |
| -2.230000000000166 | 0.167 | 0.084 | 0.056 |
| -2.220000000000166 | 0.169 | 0.084 | 0.056 |
| -2.210000000000166 | 0.17 | 0.085 | 0.057 |
| -2.200000000000166 | 0.171 | 0.086 | 0.057 |
| -2.190000000000166 | 0.173 | 0.086 | 0.058 |
| -2.180000000000167 | 0.174 | 0.087 | 0.058 |
| -2.170000000000167 | 0.175 | 0.088 | 0.058 |
| -2.160000000000167 | 0.177 | 0.088 | 0.059 |
| -2.150000000000167 | 0.178 | 0.089 | 0.059 |
| -2.140000000000168 | 0.179 | 0.09 | 0.06 |
| -2.130000000000168 | 0.181 | 0.09 | 0.06 |
| -2.120000000000168 | 0.182 | 0.091 | 0.061 |
| -2.110000000000168 | 0.183 | 0.092 | 0.061 |
| -2.100000000000168 | 0.185 | 0.092 | 0.062 |
| -2.090000000000169 | 0.186 | 0.093 | 0.062 |
| -2.080000000000169 | 0.188 | 0.094 | 0.063 |
| -2.070000000000169 | 0.189 | 0.095 | 0.063 |
| -2.060000000000169 | 0.191 | 0.095 | 0.064 |
| -2.050000000000169 | 0.192 | 0.096 | 0.064 |
| -2.04000000000017 | 0.194 | 0.097 | 0.065 |
| -2.03000000000017 | 0.195 | 0.098 | 0.065 |
| -2.02000000000017 | 0.197 | 0.098 | 0.066 |
| -2.01000000000017 | 0.198 | 0.099 | 0.066 |
| -2.000000000000171 | 0.2 | 0.1 | 0.067 |
| -1.99000000000017 | 0.202 | 0.101 | 0.067 |
| -1.98000000000017 | 0.203 | 0.102 | 0.068 |
| -1.97000000000017 | 0.205 | 0.102 | 0.068 |
| -1.96000000000017 | 0.207 | 0.103 | 0.069 |
| -1.95000000000017 | 0.208 | 0.104 | 0.069 |
| -1.94000000000017 | 0.21 | 0.105 | 0.07 |
| -1.93000000000017 | 0.212 | 0.106 | 0.071 |
| -1.92000000000017 | 0.213 | 0.107 | 0.071 |
| -1.91000000000017 | 0.215 | 0.108 | 0.072 |
| -1.90000000000017 | 0.217 | 0.108 | 0.072 |
| -1.89000000000017 | 0.219 | 0.109 | 0.073 |
| -1.88000000000017 | 0.221 | 0.11 | 0.074 |
| -1.87000000000017 | 0.222 | 0.111 | 0.074 |
| -1.86000000000017 | 0.224 | 0.112 | 0.075 |
| -1.85000000000017 | 0.226 | 0.113 | 0.075 |
| -1.84000000000017 | 0.228 | 0.114 | 0.076 |
| -1.83000000000017 | 0.23 | 0.115 | 0.077 |
| -1.82000000000017 | 0.232 | 0.116 | 0.077 |
| -1.81000000000017 | 0.234 | 0.117 | 0.078 |
| -1.80000000000017 | 0.236 | 0.118 | 0.079 |
| -1.79000000000017 | 0.238 | 0.119 | 0.079 |
| -1.78000000000017 | 0.24 | 0.12 | 0.08 |
| -1.77000000000017 | 0.242 | 0.121 | 0.081 |
| -1.76000000000017 | 0.244 | 0.122 | 0.081 |
| -1.75000000000017 | 0.246 | 0.123 | 0.082 |
| -1.74000000000017 | 0.248 | 0.124 | 0.083 |
| -1.73000000000017 | 0.25 | 0.125 | 0.083 |
| -1.72000000000017 | 0.253 | 0.126 | 0.084 |
| -1.71000000000017 | 0.255 | 0.127 | 0.085 |
| -1.70000000000017 | 0.257 | 0.129 | 0.086 |
| -1.69000000000017 | 0.259 | 0.13 | 0.086 |
| -1.68000000000017 | 0.262 | 0.131 | 0.087 |
| -1.67000000000017 | 0.264 | 0.132 | 0.088 |
| -1.66000000000017 | 0.266 | 0.133 | 0.089 |
| -1.65000000000017 | 0.269 | 0.134 | 0.09 |
| -1.64000000000017 | 0.271 | 0.136 | 0.09 |
| -1.63000000000017 | 0.273 | 0.137 | 0.091 |
| -1.62000000000017 | 0.276 | 0.138 | 0.092 |
| -1.61000000000017 | 0.278 | 0.139 | 0.093 |
| -1.60000000000017 | 0.281 | 0.14 | 0.094 |
| -1.59000000000017 | 0.283 | 0.142 | 0.094 |
| -1.58000000000017 | 0.286 | 0.143 | 0.095 |
| -1.57000000000017 | 0.289 | 0.144 | 0.096 |
| -1.56000000000017 | 0.291 | 0.146 | 0.097 |
| -1.55000000000017 | 0.294 | 0.147 | 0.098 |
| -1.54000000000017 | 0.297 | 0.148 | 0.099 |
| -1.53000000000017 | 0.299 | 0.15 | 0.1 |
| -1.52000000000017 | 0.302 | 0.151 | 0.101 |
| -1.51000000000017 | 0.305 | 0.152 | 0.102 |
| -1.50000000000017 | 0.308 | 0.154 | 0.103 |
| -1.49000000000017 | 0.311 | 0.155 | 0.104 |
| -1.48000000000017 | 0.313 | 0.157 | 0.104 |
| -1.47000000000017 | 0.316 | 0.158 | 0.105 |
| -1.46000000000017 | 0.319 | 0.16 | 0.106 |
| -1.45000000000017 | 0.322 | 0.161 | 0.107 |
| -1.44000000000017 | 0.325 | 0.163 | 0.108 |
| -1.43000000000017 | 0.328 | 0.164 | 0.109 |
| -1.42000000000017 | 0.332 | 0.166 | 0.111 |
| -1.41000000000017 | 0.335 | 0.167 | 0.112 |
| -1.40000000000017 | 0.338 | 0.169 | 0.113 |
| -1.39000000000017 | 0.341 | 0.171 | 0.114 |
| -1.38000000000017 | 0.344 | 0.172 | 0.115 |
| -1.37000000000017 | 0.348 | 0.174 | 0.116 |
| -1.36000000000017 | 0.351 | 0.175 | 0.117 |
| -1.35000000000017 | 0.354 | 0.177 | 0.118 |
| -1.34000000000017 | 0.358 | 0.179 | 0.119 |
| -1.33000000000017 | 0.361 | 0.181 | 0.12 |
| -1.32000000000017 | 0.365 | 0.182 | 0.122 |
| -1.31000000000017 | 0.368 | 0.184 | 0.123 |
| -1.30000000000017 | 0.372 | 0.186 | 0.124 |
| -1.29000000000017 | 0.375 | 0.188 | 0.125 |
| -1.28000000000017 | 0.379 | 0.19 | 0.126 |
| -1.27000000000017 | 0.383 | 0.191 | 0.128 |
| -1.26000000000017 | 0.386 | 0.193 | 0.129 |
| -1.25000000000017 | 0.39 | 0.195 | 0.13 |
| -1.24000000000017 | 0.394 | 0.197 | 0.131 |
| -1.23000000000017 | 0.398 | 0.199 | 0.133 |
| -1.22000000000017 | 0.402 | 0.201 | 0.134 |
| -1.21000000000017 | 0.406 | 0.203 | 0.135 |
| -1.20000000000017 | 0.41 | 0.205 | 0.137 |
| -1.19000000000017 | 0.414 | 0.207 | 0.138 |
| -1.18000000000017 | 0.418 | 0.209 | 0.139 |
| -1.17000000000017 | 0.422 | 0.211 | 0.141 |
| -1.16000000000017 | 0.426 | 0.213 | 0.142 |
| -1.15000000000017 | 0.431 | 0.215 | 0.144 |
| -1.14000000000017 | 0.435 | 0.217 | 0.145 |
| -1.13000000000017 | 0.439 | 0.22 | 0.146 |
| -1.12000000000017 | 0.444 | 0.222 | 0.148 |
| -1.11000000000017 | 0.448 | 0.224 | 0.149 |
| -1.10000000000017 | 0.452 | 0.226 | 0.151 |
| -1.09000000000017 | 0.457 | 0.229 | 0.152 |
| -1.08000000000017 | 0.462 | 0.231 | 0.154 |
| -1.07000000000017 | 0.466 | 0.233 | 0.155 |
| -1.06000000000017 | 0.471 | 0.235 | 0.157 |
| -1.05000000000017 | 0.476 | 0.238 | 0.159 |
| -1.04000000000017 | 0.48 | 0.24 | 0.16 |
| -1.03000000000017 | 0.485 | 0.243 | 0.162 |
| -1.02000000000017 | 0.49 | 0.245 | 0.163 |
| -1.01000000000017 | 0.495 | 0.248 | 0.165 |
| -1.00000000000017 | 0.5 | 0.25 | 0.167 |
| -0.99000000000017 | 0.505 | 0.253 | 0.168 |
| -0.98000000000017 | 0.51 | 0.255 | 0.17 |
| -0.97000000000017 | 0.515 | 0.258 | 0.172 |
| -0.96000000000017 | 0.52 | 0.26 | 0.173 |
| -0.95000000000017 | 0.526 | 0.263 | 0.175 |
| -0.94000000000017 | 0.531 | 0.265 | 0.177 |
| -0.93000000000017 | 0.536 | 0.268 | 0.179 |
| -0.92000000000017 | 0.542 | 0.271 | 0.181 |
| -0.91000000000017 | 0.547 | 0.274 | 0.182 |
| -0.90000000000017 | 0.552 | 0.276 | 0.184 |
| -0.890000000000169 | 0.558 | 0.279 | 0.186 |
| -0.880000000000169 | 0.564 | 0.282 | 0.188 |
| -0.870000000000169 | 0.569 | 0.285 | 0.19 |
| -0.860000000000169 | 0.575 | 0.287 | 0.192 |
| -0.850000000000169 | 0.581 | 0.29 | 0.194 |
| -0.840000000000169 | 0.586 | 0.293 | 0.195 |
| -0.830000000000169 | 0.592 | 0.296 | 0.197 |
| -0.820000000000169 | 0.598 | 0.299 | 0.199 |
| -0.810000000000169 | 0.604 | 0.302 | 0.201 |
| -0.800000000000169 | 0.61 | 0.305 | 0.203 |
| -0.790000000000169 | 0.616 | 0.308 | 0.205 |
| -0.780000000000169 | 0.622 | 0.311 | 0.207 |
| -0.770000000000169 | 0.628 | 0.314 | 0.209 |
| -0.760000000000169 | 0.634 | 0.317 | 0.211 |
| -0.750000000000169 | 0.64 | 0.32 | 0.213 |
| -0.740000000000169 | 0.646 | 0.323 | 0.215 |
| -0.730000000000169 | 0.652 | 0.326 | 0.217 |
| -0.720000000000169 | 0.659 | 0.329 | 0.22 |
| -0.710000000000169 | 0.665 | 0.332 | 0.222 |
| -0.700000000000169 | 0.671 | 0.336 | 0.224 |
| -0.690000000000169 | 0.677 | 0.339 | 0.226 |
| -0.680000000000169 | 0.684 | 0.342 | 0.228 |
| -0.670000000000169 | 0.69 | 0.345 | 0.23 |
| -0.660000000000169 | 0.697 | 0.348 | 0.232 |
| -0.650000000000169 | 0.703 | 0.351 | 0.234 |
| -0.640000000000169 | 0.709 | 0.355 | 0.236 |
| -0.630000000000169 | 0.716 | 0.358 | 0.239 |
| -0.620000000000169 | 0.722 | 0.361 | 0.241 |
| -0.610000000000169 | 0.729 | 0.364 | 0.243 |
| -0.600000000000169 | 0.735 | 0.368 | 0.245 |
| -0.590000000000169 | 0.742 | 0.371 | 0.247 |
| -0.580000000000169 | 0.748 | 0.374 | 0.249 |
| -0.570000000000169 | 0.755 | 0.377 | 0.252 |
| -0.560000000000169 | 0.761 | 0.381 | 0.254 |
| -0.550000000000169 | 0.768 | 0.384 | 0.256 |
| -0.540000000000169 | 0.774 | 0.387 | 0.258 |
| -0.530000000000169 | 0.781 | 0.39 | 0.26 |
| -0.520000000000169 | 0.787 | 0.394 | 0.262 |
| -0.510000000000169 | 0.794 | 0.397 | 0.265 |
| -0.500000000000169 | 0.8 | 0.4 | 0.267 |
| -0.490000000000169 | 0.806 | 0.403 | 0.269 |
| -0.480000000000169 | 0.813 | 0.406 | 0.271 |
| -0.470000000000169 | 0.819 | 0.41 | 0.273 |
| -0.460000000000169 | 0.825 | 0.413 | 0.275 |
| -0.450000000000169 | 0.832 | 0.416 | 0.277 |
| -0.440000000000169 | 0.838 | 0.419 | 0.279 |
| -0.430000000000169 | 0.844 | 0.422 | 0.281 |
| -0.420000000000169 | 0.85 | 0.425 | 0.283 |
| -0.410000000000169 | 0.856 | 0.428 | 0.285 |
| -0.400000000000169 | 0.862 | 0.431 | 0.287 |
| -0.390000000000169 | 0.868 | 0.434 | 0.289 |
| -0.380000000000169 | 0.874 | 0.437 | 0.291 |
| -0.370000000000169 | 0.88 | 0.44 | 0.293 |
| -0.360000000000169 | 0.885 | 0.443 | 0.295 |
| -0.350000000000169 | 0.891 | 0.445 | 0.297 |
| -0.340000000000169 | 0.896 | 0.448 | 0.299 |
| -0.330000000000169 | 0.902 | 0.451 | 0.301 |
| -0.320000000000169 | 0.907 | 0.454 | 0.302 |
| -0.310000000000169 | 0.912 | 0.456 | 0.304 |
| -0.300000000000169 | 0.917 | 0.459 | 0.306 |
| -0.290000000000169 | 0.922 | 0.461 | 0.307 |
| -0.280000000000169 | 0.927 | 0.464 | 0.309 |
| -0.270000000000169 | 0.932 | 0.466 | 0.311 |
| -0.260000000000169 | 0.937 | 0.468 | 0.312 |
| -0.250000000000169 | 0.941 | 0.471 | 0.314 |
| -0.240000000000169 | 0.946 | 0.473 | 0.315 |
| -0.230000000000169 | 0.95 | 0.475 | 0.317 |
| -0.220000000000169 | 0.954 | 0.477 | 0.318 |
| -0.210000000000169 | 0.958 | 0.479 | 0.319 |
| -0.200000000000169 | 0.962 | 0.481 | 0.321 |
| -0.190000000000169 | 0.965 | 0.483 | 0.322 |
| -0.180000000000169 | 0.969 | 0.484 | 0.323 |
| -0.170000000000169 | 0.972 | 0.486 | 0.324 |
| -0.160000000000169 | 0.975 | 0.488 | 0.325 |
| -0.150000000000169 | 0.978 | 0.489 | 0.326 |
| -0.140000000000169 | 0.981 | 0.49 | 0.327 |
| -0.130000000000169 | 0.983 | 0.492 | 0.328 |
| -0.120000000000169 | 0.986 | 0.493 | 0.329 |
| -0.110000000000169 | 0.988 | 0.494 | 0.329 |
| -0.100000000000169 | 0.99 | 0.495 | 0.33 |
| -0.0900000000001689 | 0.992 | 0.496 | 0.331 |
| -0.0800000000001689 | 0.994 | 0.497 | 0.331 |
| -0.0700000000001689 | 0.995 | 0.498 | 0.332 |
| -0.0600000000001689 | 0.996 | 0.498 | 0.332 |
| -0.0500000000001689 | 0.998 | 0.499 | 0.333 |
| -0.0400000000001689 | 0.998 | 0.499 | 0.333 |
| -0.0300000000001689 | 0.999 | 0.5 | 0.333 |
| -0.0200000000001689 | 1 | 0.5 | 0.333 |
| -0.0100000000001689 | 1 | 0.5 | 0.333 |
| -1.6888920817415e-13 | 1 | 0.5 | 0.333 |
| 0.00999999999983111 | 1 | 0.5 | 0.333 |
| 0.0199999999998311 | 1 | 0.5 | 0.333 |
| 0.0299999999998311 | 0.999 | 0.5 | 0.333 |
| 0.0399999999998311 | 0.998 | 0.499 | 0.333 |
| 0.0499999999998311 | 0.998 | 0.499 | 0.333 |
| 0.0599999999998311 | 0.996 | 0.498 | 0.332 |
| 0.0699999999998311 | 0.995 | 0.498 | 0.332 |
| 0.0799999999998311 | 0.994 | 0.497 | 0.331 |
| 0.0899999999998311 | 0.992 | 0.496 | 0.331 |
| 0.0999999999998311 | 0.99 | 0.495 | 0.33 |
| 0.109999999999831 | 0.988 | 0.494 | 0.329 |
| 0.119999999999831 | 0.986 | 0.493 | 0.329 |
| 0.129999999999831 | 0.983 | 0.492 | 0.328 |
| 0.139999999999831 | 0.981 | 0.49 | 0.327 |
| 0.149999999999831 | 0.978 | 0.489 | 0.326 |
| 0.159999999999831 | 0.975 | 0.488 | 0.325 |
| 0.169999999999831 | 0.972 | 0.486 | 0.324 |
| 0.179999999999831 | 0.969 | 0.484 | 0.323 |
| 0.189999999999831 | 0.965 | 0.483 | 0.322 |
| 0.199999999999831 | 0.962 | 0.481 | 0.321 |
| 0.209999999999831 | 0.958 | 0.479 | 0.319 |
| 0.219999999999831 | 0.954 | 0.477 | 0.318 |
| 0.229999999999831 | 0.95 | 0.475 | 0.317 |
| 0.239999999999831 | 0.946 | 0.473 | 0.315 |
| 0.249999999999831 | 0.941 | 0.471 | 0.314 |
| 0.259999999999831 | 0.937 | 0.468 | 0.312 |
| 0.269999999999831 | 0.932 | 0.466 | 0.311 |
| 0.279999999999831 | 0.927 | 0.464 | 0.309 |
| 0.289999999999831 | 0.922 | 0.461 | 0.307 |
| 0.299999999999831 | 0.917 | 0.459 | 0.306 |
| 0.309999999999831 | 0.912 | 0.456 | 0.304 |
| 0.319999999999831 | 0.907 | 0.454 | 0.302 |
| 0.329999999999831 | 0.902 | 0.451 | 0.301 |
| 0.339999999999831 | 0.896 | 0.448 | 0.299 |
| 0.349999999999831 | 0.891 | 0.445 | 0.297 |
| 0.359999999999831 | 0.885 | 0.443 | 0.295 |
| 0.369999999999831 | 0.88 | 0.44 | 0.293 |
| 0.379999999999831 | 0.874 | 0.437 | 0.291 |
| 0.389999999999831 | 0.868 | 0.434 | 0.289 |
| 0.399999999999831 | 0.862 | 0.431 | 0.287 |
| 0.409999999999831 | 0.856 | 0.428 | 0.285 |
| 0.419999999999831 | 0.85 | 0.425 | 0.283 |
| 0.429999999999831 | 0.844 | 0.422 | 0.281 |
| 0.439999999999831 | 0.838 | 0.419 | 0.279 |
| 0.449999999999831 | 0.832 | 0.416 | 0.277 |
| 0.459999999999831 | 0.825 | 0.413 | 0.275 |
| 0.469999999999831 | 0.819 | 0.41 | 0.273 |
| 0.479999999999831 | 0.813 | 0.406 | 0.271 |
| 0.489999999999831 | 0.806 | 0.403 | 0.269 |
| 0.499999999999831 | 0.8 | 0.4 | 0.267 |
| 0.509999999999831 | 0.794 | 0.397 | 0.265 |
| 0.519999999999831 | 0.787 | 0.394 | 0.262 |
| 0.529999999999831 | 0.781 | 0.39 | 0.26 |
| 0.539999999999831 | 0.774 | 0.387 | 0.258 |
| 0.549999999999831 | 0.768 | 0.384 | 0.256 |
| 0.559999999999831 | 0.761 | 0.381 | 0.254 |
| 0.569999999999831 | 0.755 | 0.377 | 0.252 |
| 0.579999999999831 | 0.748 | 0.374 | 0.249 |
| 0.589999999999831 | 0.742 | 0.371 | 0.247 |
| 0.599999999999831 | 0.735 | 0.368 | 0.245 |
| 0.609999999999831 | 0.729 | 0.364 | 0.243 |
| 0.619999999999831 | 0.722 | 0.361 | 0.241 |
| 0.629999999999831 | 0.716 | 0.358 | 0.239 |
| 0.639999999999831 | 0.709 | 0.355 | 0.236 |
| 0.649999999999831 | 0.703 | 0.351 | 0.234 |
| 0.659999999999831 | 0.697 | 0.348 | 0.232 |
| 0.669999999999831 | 0.69 | 0.345 | 0.23 |
| 0.679999999999831 | 0.684 | 0.342 | 0.228 |
| 0.689999999999831 | 0.677 | 0.339 | 0.226 |
| 0.699999999999831 | 0.671 | 0.336 | 0.224 |
| 0.709999999999831 | 0.665 | 0.332 | 0.222 |
| 0.719999999999831 | 0.659 | 0.329 | 0.22 |
| 0.729999999999831 | 0.652 | 0.326 | 0.217 |
| 0.739999999999831 | 0.646 | 0.323 | 0.215 |
| 0.749999999999832 | 0.64 | 0.32 | 0.213 |
| 0.759999999999832 | 0.634 | 0.317 | 0.211 |
| 0.769999999999832 | 0.628 | 0.314 | 0.209 |
| 0.779999999999832 | 0.622 | 0.311 | 0.207 |
| 0.789999999999832 | 0.616 | 0.308 | 0.205 |
| 0.799999999999832 | 0.61 | 0.305 | 0.203 |
| 0.809999999999832 | 0.604 | 0.302 | 0.201 |
| 0.819999999999832 | 0.598 | 0.299 | 0.199 |
| 0.829999999999832 | 0.592 | 0.296 | 0.197 |
| 0.839999999999832 | 0.586 | 0.293 | 0.195 |
| 0.849999999999832 | 0.581 | 0.29 | 0.194 |
| 0.859999999999832 | 0.575 | 0.287 | 0.192 |
| 0.869999999999832 | 0.569 | 0.285 | 0.19 |
| 0.879999999999832 | 0.564 | 0.282 | 0.188 |
| 0.889999999999832 | 0.558 | 0.279 | 0.186 |
| 0.899999999999832 | 0.552 | 0.276 | 0.184 |
| 0.909999999999832 | 0.547 | 0.274 | 0.182 |
| 0.919999999999832 | 0.542 | 0.271 | 0.181 |
| 0.929999999999832 | 0.536 | 0.268 | 0.179 |
| 0.939999999999832 | 0.531 | 0.265 | 0.177 |
| 0.949999999999832 | 0.526 | 0.263 | 0.175 |
| 0.959999999999832 | 0.52 | 0.26 | 0.173 |
| 0.969999999999832 | 0.515 | 0.258 | 0.172 |
| 0.979999999999832 | 0.51 | 0.255 | 0.17 |
| 0.989999999999832 | 0.505 | 0.253 | 0.168 |
| 0.999999999999832 | 0.5 | 0.25 | 0.167 |
| 1.009999999999832 | 0.495 | 0.248 | 0.165 |
| 1.019999999999832 | 0.49 | 0.245 | 0.163 |
| 1.029999999999832 | 0.485 | 0.243 | 0.162 |
| 1.039999999999832 | 0.48 | 0.24 | 0.16 |
| 1.049999999999832 | 0.476 | 0.238 | 0.159 |
| 1.059999999999832 | 0.471 | 0.235 | 0.157 |
| 1.069999999999832 | 0.466 | 0.233 | 0.155 |
| 1.079999999999832 | 0.462 | 0.231 | 0.154 |
| 1.089999999999832 | 0.457 | 0.229 | 0.152 |
| 1.099999999999832 | 0.452 | 0.226 | 0.151 |
| 1.109999999999832 | 0.448 | 0.224 | 0.149 |
| 1.119999999999832 | 0.444 | 0.222 | 0.148 |
| 1.129999999999832 | 0.439 | 0.22 | 0.146 |
| 1.139999999999832 | 0.435 | 0.217 | 0.145 |
| 1.149999999999832 | 0.431 | 0.215 | 0.144 |
| 1.159999999999832 | 0.426 | 0.213 | 0.142 |
| 1.169999999999832 | 0.422 | 0.211 | 0.141 |
| 1.179999999999832 | 0.418 | 0.209 | 0.139 |
| 1.189999999999832 | 0.414 | 0.207 | 0.138 |
| 1.199999999999832 | 0.41 | 0.205 | 0.137 |
| 1.209999999999832 | 0.406 | 0.203 | 0.135 |
| 1.219999999999832 | 0.402 | 0.201 | 0.134 |
| 1.229999999999832 | 0.398 | 0.199 | 0.133 |
| 1.239999999999832 | 0.394 | 0.197 | 0.131 |
| 1.249999999999832 | 0.39 | 0.195 | 0.13 |
| 1.259999999999832 | 0.386 | 0.193 | 0.129 |
| 1.269999999999832 | 0.383 | 0.191 | 0.128 |
| 1.279999999999832 | 0.379 | 0.19 | 0.126 |
| 1.289999999999832 | 0.375 | 0.188 | 0.125 |
| 1.299999999999832 | 0.372 | 0.186 | 0.124 |
| 1.309999999999832 | 0.368 | 0.184 | 0.123 |
| 1.319999999999832 | 0.365 | 0.182 | 0.122 |
| 1.329999999999832 | 0.361 | 0.181 | 0.12 |
| 1.339999999999832 | 0.358 | 0.179 | 0.119 |
| 1.349999999999832 | 0.354 | 0.177 | 0.118 |
| 1.359999999999832 | 0.351 | 0.175 | 0.117 |
| 1.369999999999832 | 0.348 | 0.174 | 0.116 |
| 1.379999999999832 | 0.344 | 0.172 | 0.115 |
| 1.389999999999832 | 0.341 | 0.171 | 0.114 |
| 1.399999999999832 | 0.338 | 0.169 | 0.113 |
| 1.409999999999832 | 0.335 | 0.167 | 0.112 |
| 1.419999999999832 | 0.332 | 0.166 | 0.111 |
| 1.429999999999832 | 0.328 | 0.164 | 0.109 |
| 1.439999999999832 | 0.325 | 0.163 | 0.108 |
| 1.449999999999832 | 0.322 | 0.161 | 0.107 |
| 1.459999999999832 | 0.319 | 0.16 | 0.106 |
| 1.469999999999832 | 0.316 | 0.158 | 0.105 |
| 1.479999999999832 | 0.313 | 0.157 | 0.104 |
| 1.489999999999832 | 0.311 | 0.155 | 0.104 |
| 1.499999999999832 | 0.308 | 0.154 | 0.103 |
| 1.509999999999832 | 0.305 | 0.152 | 0.102 |
| 1.519999999999832 | 0.302 | 0.151 | 0.101 |
| 1.529999999999832 | 0.299 | 0.15 | 0.1 |
| 1.539999999999832 | 0.297 | 0.148 | 0.099 |
| 1.549999999999832 | 0.294 | 0.147 | 0.098 |
| 1.559999999999832 | 0.291 | 0.146 | 0.097 |
| 1.569999999999832 | 0.289 | 0.144 | 0.096 |
| 1.579999999999832 | 0.286 | 0.143 | 0.095 |
| 1.589999999999832 | 0.283 | 0.142 | 0.094 |
| 1.599999999999832 | 0.281 | 0.14 | 0.094 |
| 1.609999999999832 | 0.278 | 0.139 | 0.093 |
| 1.619999999999832 | 0.276 | 0.138 | 0.092 |
| 1.629999999999832 | 0.273 | 0.137 | 0.091 |
| 1.639999999999832 | 0.271 | 0.136 | 0.09 |
| 1.649999999999832 | 0.269 | 0.134 | 0.09 |
| 1.659999999999832 | 0.266 | 0.133 | 0.089 |
| 1.669999999999832 | 0.264 | 0.132 | 0.088 |
| 1.679999999999832 | 0.262 | 0.131 | 0.087 |
| 1.689999999999832 | 0.259 | 0.13 | 0.086 |
| 1.699999999999832 | 0.257 | 0.129 | 0.086 |
| 1.709999999999832 | 0.255 | 0.127 | 0.085 |
| 1.719999999999832 | 0.253 | 0.126 | 0.084 |
| 1.729999999999832 | 0.25 | 0.125 | 0.083 |
| 1.739999999999832 | 0.248 | 0.124 | 0.083 |
| 1.749999999999832 | 0.246 | 0.123 | 0.082 |
| 1.759999999999832 | 0.244 | 0.122 | 0.081 |
| 1.769999999999832 | 0.242 | 0.121 | 0.081 |
| 1.779999999999832 | 0.24 | 0.12 | 0.08 |
| 1.789999999999832 | 0.238 | 0.119 | 0.079 |
| 1.799999999999832 | 0.236 | 0.118 | 0.079 |
| 1.809999999999832 | 0.234 | 0.117 | 0.078 |
| 1.819999999999832 | 0.232 | 0.116 | 0.077 |
| 1.829999999999832 | 0.23 | 0.115 | 0.077 |
| 1.839999999999832 | 0.228 | 0.114 | 0.076 |
| 1.849999999999832 | 0.226 | 0.113 | 0.075 |
| 1.859999999999832 | 0.224 | 0.112 | 0.075 |
| 1.869999999999832 | 0.222 | 0.111 | 0.074 |
| 1.879999999999832 | 0.221 | 0.11 | 0.074 |
| 1.889999999999832 | 0.219 | 0.109 | 0.073 |
| 1.899999999999832 | 0.217 | 0.108 | 0.072 |
| 1.909999999999832 | 0.215 | 0.108 | 0.072 |
| 1.919999999999832 | 0.213 | 0.107 | 0.071 |
| 1.929999999999832 | 0.212 | 0.106 | 0.071 |
| 1.939999999999832 | 0.21 | 0.105 | 0.07 |
| 1.949999999999833 | 0.208 | 0.104 | 0.069 |
| 1.959999999999833 | 0.207 | 0.103 | 0.069 |
| 1.969999999999833 | 0.205 | 0.102 | 0.068 |
| 1.979999999999833 | 0.203 | 0.102 | 0.068 |
| 1.989999999999833 | 0.202 | 0.101 | 0.067 |
| 1.999999999999833 | 0.2 | 0.1 | 0.067 |
| 2.009999999999832 | 0.198 | 0.099 | 0.066 |
| 2.019999999999832 | 0.197 | 0.098 | 0.066 |
| 2.029999999999832 | 0.195 | 0.098 | 0.065 |
| 2.039999999999832 | 0.194 | 0.097 | 0.065 |
| 2.049999999999832 | 0.192 | 0.096 | 0.064 |
| 2.059999999999831 | 0.191 | 0.095 | 0.064 |
| 2.069999999999831 | 0.189 | 0.095 | 0.063 |
| 2.079999999999831 | 0.188 | 0.094 | 0.063 |
| 2.089999999999831 | 0.186 | 0.093 | 0.062 |
| 2.09999999999983 | 0.185 | 0.092 | 0.062 |
| 2.10999999999983 | 0.183 | 0.092 | 0.061 |
| 2.11999999999983 | 0.182 | 0.091 | 0.061 |
| 2.12999999999983 | 0.181 | 0.09 | 0.06 |
| 2.13999999999983 | 0.179 | 0.09 | 0.06 |
| 2.149999999999829 | 0.178 | 0.089 | 0.059 |
| 2.159999999999829 | 0.177 | 0.088 | 0.059 |
| 2.169999999999829 | 0.175 | 0.088 | 0.058 |
| 2.179999999999829 | 0.174 | 0.087 | 0.058 |
| 2.189999999999829 | 0.173 | 0.086 | 0.058 |
| 2.199999999999828 | 0.171 | 0.086 | 0.057 |
| 2.209999999999828 | 0.17 | 0.085 | 0.057 |
| 2.219999999999828 | 0.169 | 0.084 | 0.056 |
| 2.229999999999828 | 0.167 | 0.084 | 0.056 |
| 2.239999999999827 | 0.166 | 0.083 | 0.055 |
| 2.249999999999827 | 0.165 | 0.082 | 0.055 |
| 2.259999999999827 | 0.164 | 0.082 | 0.055 |
| 2.269999999999827 | 0.163 | 0.081 | 0.054 |
| 2.279999999999827 | 0.161 | 0.081 | 0.054 |
| 2.289999999999826 | 0.16 | 0.08 | 0.053 |
| 2.299999999999826 | 0.159 | 0.079 | 0.053 |
| 2.309999999999826 | 0.158 | 0.079 | 0.053 |
| 2.319999999999826 | 0.157 | 0.078 | 0.052 |
| 2.329999999999825 | 0.156 | 0.078 | 0.052 |
| 2.339999999999825 | 0.154 | 0.077 | 0.051 |
| 2.349999999999825 | 0.153 | 0.077 | 0.051 |
| 2.359999999999825 | 0.152 | 0.076 | 0.051 |
| 2.369999999999825 | 0.151 | 0.076 | 0.05 |
| 2.379999999999824 | 0.15 | 0.075 | 0.05 |
| 2.389999999999824 | 0.149 | 0.074 | 0.05 |
| 2.399999999999824 | 0.148 | 0.074 | 0.049 |
| 2.409999999999824 | 0.147 | 0.073 | 0.049 |
| 2.419999999999824 | 0.146 | 0.073 | 0.049 |
| 2.429999999999823 | 0.145 | 0.072 | 0.048 |
| 2.439999999999823 | 0.144 | 0.072 | 0.048 |
| 2.449999999999823 | 0.143 | 0.071 | 0.048 |
| 2.459999999999823 | 0.142 | 0.071 | 0.047 |
| 2.469999999999823 | 0.141 | 0.07 | 0.047 |
| 2.479999999999822 | 0.14 | 0.07 | 0.047 |
| 2.489999999999822 | 0.139 | 0.069 | 0.046 |
| 2.499999999999822 | 0.138 | 0.069 | 0.046 |
| 2.509999999999822 | 0.137 | 0.068 | 0.046 |
| 2.519999999999821 | 0.136 | 0.068 | 0.045 |
| 2.529999999999821 | 0.135 | 0.068 | 0.045 |
| 2.539999999999821 | 0.134 | 0.067 | 0.045 |
| 2.549999999999821 | 0.133 | 0.067 | 0.044 |
| 2.559999999999821 | 0.132 | 0.066 | 0.044 |
| 2.56999999999982 | 0.131 | 0.066 | 0.044 |
| 2.57999999999982 | 0.131 | 0.065 | 0.044 |
| 2.58999999999982 | 0.13 | 0.065 | 0.043 |
| 2.59999999999982 | 0.129 | 0.064 | 0.043 |
| 2.609999999999819 | 0.128 | 0.064 | 0.043 |
| 2.619999999999819 | 0.127 | 0.064 | 0.042 |
| 2.629999999999819 | 0.126 | 0.063 | 0.042 |
| 2.639999999999819 | 0.125 | 0.063 | 0.042 |
| 2.649999999999819 | 0.125 | 0.062 | 0.042 |
| 2.659999999999818 | 0.124 | 0.062 | 0.041 |
| 2.669999999999818 | 0.123 | 0.062 | 0.041 |
| 2.679999999999818 | 0.122 | 0.061 | 0.041 |
| 2.689999999999818 | 0.121 | 0.061 | 0.04 |
| 2.699999999999818 | 0.121 | 0.06 | 0.04 |
| 2.709999999999817 | 0.12 | 0.06 | 0.04 |
| 2.719999999999817 | 0.119 | 0.06 | 0.04 |
| 2.729999999999817 | 0.118 | 0.059 | 0.039 |
| 2.739999999999817 | 0.118 | 0.059 | 0.039 |
| 2.749999999999817 | 0.117 | 0.058 | 0.039 |
| 2.759999999999816 | 0.116 | 0.058 | 0.039 |
| 2.769999999999816 | 0.115 | 0.058 | 0.038 |
| 2.779999999999816 | 0.115 | 0.057 | 0.038 |
| 2.789999999999816 | 0.114 | 0.057 | 0.038 |
| 2.799999999999815 | 0.113 | 0.057 | 0.038 |
| 2.809999999999815 | 0.112 | 0.056 | 0.037 |
| 2.819999999999815 | 0.112 | 0.056 | 0.037 |
| 2.829999999999815 | 0.111 | 0.056 | 0.037 |
| 2.839999999999815 | 0.11 | 0.055 | 0.037 |
| 2.849999999999814 | 0.11 | 0.055 | 0.037 |
| 2.859999999999814 | 0.109 | 0.054 | 0.036 |
| 2.869999999999814 | 0.108 | 0.054 | 0.036 |
| 2.879999999999814 | 0.108 | 0.054 | 0.036 |
| 2.889999999999814 | 0.107 | 0.053 | 0.036 |
| 2.899999999999813 | 0.106 | 0.053 | 0.035 |
| 2.909999999999813 | 0.106 | 0.053 | 0.035 |
| 2.919999999999813 | 0.105 | 0.052 | 0.035 |
| 2.929999999999813 | 0.104 | 0.052 | 0.035 |
| 2.939999999999813 | 0.104 | 0.052 | 0.035 |
| 2.949999999999812 | 0.103 | 0.052 | 0.034 |
| 2.959999999999812 | 0.102 | 0.051 | 0.034 |
| 2.969999999999812 | 0.102 | 0.051 | 0.034 |
| 2.979999999999812 | 0.101 | 0.051 | 0.034 |
| 2.989999999999811 | 0.101 | 0.05 | 0.034 |
| 2.999999999999811 | 0.1 | 0.05 | 0.033 |
| 3.009999999999811 | 0.099 | 0.05 | 0.033 |
| 3.019999999999811 | 0.099 | 0.049 | 0.033 |
| 3.029999999999811 | 0.098 | 0.049 | 0.033 |
| 3.03999999999981 | 0.098 | 0.049 | 0.033 |
| 3.04999999999981 | 0.097 | 0.049 | 0.032 |
| 3.05999999999981 | 0.096 | 0.048 | 0.032 |
| 3.06999999999981 | 0.096 | 0.048 | 0.032 |
| 3.07999999999981 | 0.095 | 0.048 | 0.032 |
| 3.089999999999809 | 0.095 | 0.047 | 0.032 |
| 3.099999999999809 | 0.094 | 0.047 | 0.031 |
| 3.109999999999809 | 0.094 | 0.047 | 0.031 |
| 3.119999999999809 | 0.093 | 0.047 | 0.031 |
| 3.129999999999808 | 0.093 | 0.046 | 0.031 |
| 3.139999999999808 | 0.092 | 0.046 | 0.031 |
| 3.149999999999808 | 0.092 | 0.046 | 0.031 |
| 3.159999999999808 | 0.091 | 0.046 | 0.03 |
| 3.169999999999808 | 0.091 | 0.045 | 0.03 |
| 3.179999999999807 | 0.09 | 0.045 | 0.03 |
| 3.189999999999807 | 0.089 | 0.045 | 0.03 |
| 3.199999999999807 | 0.089 | 0.044 | 0.03 |
| 3.209999999999807 | 0.088 | 0.044 | 0.029 |
| 3.219999999999807 | 0.088 | 0.044 | 0.029 |
| 3.229999999999806 | 0.087 | 0.044 | 0.029 |
| 3.239999999999806 | 0.087 | 0.043 | 0.029 |
| 3.249999999999806 | 0.086 | 0.043 | 0.029 |
| 3.259999999999806 | 0.086 | 0.043 | 0.029 |
| 3.269999999999805 | 0.086 | 0.043 | 0.029 |
| 3.279999999999805 | 0.085 | 0.043 | 0.028 |
| 3.289999999999805 | 0.085 | 0.042 | 0.028 |
| 3.299999999999805 | 0.084 | 0.042 | 0.028 |
| 3.309999999999805 | 0.084 | 0.042 | 0.028 |
| 3.319999999999804 | 0.083 | 0.042 | 0.028 |
| 3.329999999999804 | 0.083 | 0.041 | 0.028 |
| 3.339999999999804 | 0.082 | 0.041 | 0.027 |
| 3.349999999999804 | 0.082 | 0.041 | 0.027 |
| 3.359999999999804 | 0.081 | 0.041 | 0.027 |
| 3.369999999999803 | 0.081 | 0.04 | 0.027 |
| 3.379999999999803 | 0.08 | 0.04 | 0.027 |
| 3.389999999999803 | 0.08 | 0.04 | 0.027 |
| 3.399999999999803 | 0.08 | 0.04 | 0.027 |
| 3.409999999999802 | 0.079 | 0.04 | 0.026 |
| 3.419999999999802 | 0.079 | 0.039 | 0.026 |
| 3.429999999999802 | 0.078 | 0.039 | 0.026 |
| 3.439999999999802 | 0.078 | 0.039 | 0.026 |
| 3.449999999999802 | 0.078 | 0.039 | 0.026 |
| 3.459999999999801 | 0.077 | 0.039 | 0.026 |
| 3.469999999999801 | 0.077 | 0.038 | 0.026 |
| 3.479999999999801 | 0.076 | 0.038 | 0.025 |
| 3.489999999999801 | 0.076 | 0.038 | 0.025 |
| 3.499999999999801 | 0.075 | 0.038 | 0.025 |
| 3.5099999999998 | 0.075 | 0.038 | 0.025 |
| 3.5199999999998 | 0.075 | 0.037 | 0.025 |
| 3.5299999999998 | 0.074 | 0.037 | 0.025 |
| 3.5399999999998 | 0.074 | 0.037 | 0.025 |
| 3.5499999999998 | 0.074 | 0.037 | 0.025 |
| 3.559999999999799 | 0.073 | 0.037 | 0.024 |
| 3.569999999999799 | 0.073 | 0.036 | 0.024 |
| 3.579999999999799 | 0.072 | 0.036 | 0.024 |
| 3.589999999999799 | 0.072 | 0.036 | 0.024 |
| 3.599999999999798 | 0.072 | 0.036 | 0.024 |
| 3.609999999999798 | 0.071 | 0.036 | 0.024 |
| 3.619999999999798 | 0.071 | 0.035 | 0.024 |
| 3.629999999999798 | 0.071 | 0.035 | 0.024 |
| 3.639999999999798 | 0.07 | 0.035 | 0.023 |
| 3.649999999999797 | 0.07 | 0.035 | 0.023 |
| 3.659999999999797 | 0.069 | 0.035 | 0.023 |
| 3.669999999999797 | 0.069 | 0.035 | 0.023 |
| 3.679999999999797 | 0.069 | 0.034 | 0.023 |
| 3.689999999999796 | 0.068 | 0.034 | 0.023 |
| 3.699999999999796 | 0.068 | 0.034 | 0.023 |
| 3.709999999999796 | 0.068 | 0.034 | 0.023 |
| 3.719999999999796 | 0.067 | 0.034 | 0.022 |
| 3.729999999999796 | 0.067 | 0.034 | 0.022 |
| 3.739999999999795 | 0.067 | 0.033 | 0.022 |
| 3.749999999999795 | 0.066 | 0.033 | 0.022 |
| 3.759999999999795 | 0.066 | 0.033 | 0.022 |
| 3.769999999999795 | 0.066 | 0.033 | 0.022 |
| 3.779999999999795 | 0.065 | 0.033 | 0.022 |
| 3.789999999999794 | 0.065 | 0.033 | 0.022 |
| 3.799999999999794 | 0.065 | 0.032 | 0.022 |
| 3.809999999999794 | 0.064 | 0.032 | 0.021 |
| 3.819999999999794 | 0.064 | 0.032 | 0.021 |
| 3.829999999999794 | 0.064 | 0.032 | 0.021 |
| 3.839999999999793 | 0.064 | 0.032 | 0.021 |
| 3.849999999999793 | 0.063 | 0.032 | 0.021 |
| 3.859999999999793 | 0.063 | 0.031 | 0.021 |
| 3.869999999999793 | 0.063 | 0.031 | 0.021 |
| 3.879999999999792 | 0.062 | 0.031 | 0.021 |
| 3.889999999999792 | 0.062 | 0.031 | 0.021 |
| 3.899999999999792 | 0.062 | 0.031 | 0.021 |
| 3.909999999999792 | 0.061 | 0.031 | 0.02 |
| 3.919999999999792 | 0.061 | 0.031 | 0.02 |
| 3.929999999999791 | 0.061 | 0.03 | 0.02 |
| 3.939999999999791 | 0.061 | 0.03 | 0.02 |
| 3.949999999999791 | 0.06 | 0.03 | 0.02 |
| 3.959999999999791 | 0.06 | 0.03 | 0.02 |
| 3.969999999999791 | 0.06 | 0.03 | 0.02 |
| 3.97999999999979 | 0.059 | 0.03 | 0.02 |
| 3.98999999999979 | 0.059 | 0.03 | 0.02 |
| 3.99999999999979 | 0.059 | 0.029 | 0.02 |
| 4.00999999999979 | 0.059 | 0.029 | 0.02 |
| 4.01999999999979 | 0.058 | 0.029 | 0.019 |
| 4.02999999999979 | 0.058 | 0.029 | 0.019 |
| 4.03999999999979 | 0.058 | 0.029 | 0.019 |
| 4.04999999999979 | 0.057 | 0.029 | 0.019 |
| 4.05999999999979 | 0.057 | 0.029 | 0.019 |
| 4.069999999999789 | 0.057 | 0.028 | 0.019 |
| 4.079999999999788 | 0.057 | 0.028 | 0.019 |
| 4.089999999999788 | 0.056 | 0.028 | 0.019 |
| 4.099999999999788 | 0.056 | 0.028 | 0.019 |
| 4.109999999999788 | 0.056 | 0.028 | 0.019 |
| 4.119999999999788 | 0.056 | 0.028 | 0.019 |
| 4.129999999999788 | 0.055 | 0.028 | 0.018 |
| 4.139999999999787 | 0.055 | 0.028 | 0.018 |
| 4.149999999999787 | 0.055 | 0.027 | 0.018 |
| 4.159999999999787 | 0.055 | 0.027 | 0.018 |
| 4.169999999999787 | 0.054 | 0.027 | 0.018 |
| 4.179999999999786 | 0.054 | 0.027 | 0.018 |
| 4.189999999999786 | 0.054 | 0.027 | 0.018 |
| 4.199999999999786 | 0.054 | 0.027 | 0.018 |
| 4.209999999999785 | 0.053 | 0.027 | 0.018 |
| 4.219999999999785 | 0.053 | 0.027 | 0.018 |
| 4.229999999999785 | 0.053 | 0.026 | 0.018 |
| 4.239999999999785 | 0.053 | 0.026 | 0.018 |
| 4.249999999999785 | 0.052 | 0.026 | 0.017 |
| 4.259999999999784 | 0.052 | 0.026 | 0.017 |
| 4.269999999999784 | 0.052 | 0.026 | 0.017 |
| 4.279999999999784 | 0.052 | 0.026 | 0.017 |
| 4.289999999999784 | 0.052 | 0.026 | 0.017 |
| 4.299999999999784 | 0.051 | 0.026 | 0.017 |
| 4.309999999999784 | 0.051 | 0.026 | 0.017 |
| 4.319999999999784 | 0.051 | 0.025 | 0.017 |
| 4.329999999999783 | 0.051 | 0.025 | 0.017 |
| 4.339999999999783 | 0.05 | 0.025 | 0.017 |
| 4.349999999999783 | 0.05 | 0.025 | 0.017 |
| 4.359999999999783 | 0.05 | 0.025 | 0.017 |
| 4.369999999999782 | 0.05 | 0.025 | 0.017 |
| 4.379999999999782 | 0.05 | 0.025 | 0.017 |
| 4.389999999999782 | 0.049 | 0.025 | 0.016 |
| 4.399999999999782 | 0.049 | 0.025 | 0.016 |
| 4.409999999999781 | 0.049 | 0.024 | 0.016 |
| 4.419999999999781 | 0.049 | 0.024 | 0.016 |
| 4.429999999999781 | 0.048 | 0.024 | 0.016 |
| 4.43999999999978 | 0.048 | 0.024 | 0.016 |
| 4.44999999999978 | 0.048 | 0.024 | 0.016 |
| 4.45999999999978 | 0.048 | 0.024 | 0.016 |
| 4.46999999999978 | 0.048 | 0.024 | 0.016 |
| 4.47999999999978 | 0.047 | 0.024 | 0.016 |
| 4.48999999999978 | 0.047 | 0.024 | 0.016 |
| 4.49999999999978 | 0.047 | 0.024 | 0.016 |
| 4.50999999999978 | 0.047 | 0.023 | 0.016 |
| 4.51999999999978 | 0.047 | 0.023 | 0.016 |
| 4.52999999999978 | 0.046 | 0.023 | 0.015 |
| 4.539999999999778 | 0.046 | 0.023 | 0.015 |
| 4.549999999999778 | 0.046 | 0.023 | 0.015 |
| 4.559999999999778 | 0.046 | 0.023 | 0.015 |
| 4.569999999999778 | 0.046 | 0.023 | 0.015 |
| 4.579999999999778 | 0.046 | 0.023 | 0.015 |
| 4.589999999999777 | 0.045 | 0.023 | 0.015 |
| 4.599999999999777 | 0.045 | 0.023 | 0.015 |
| 4.609999999999777 | 0.045 | 0.022 | 0.015 |
| 4.619999999999777 | 0.045 | 0.022 | 0.015 |
| 4.629999999999777 | 0.045 | 0.022 | 0.015 |
| 4.639999999999776 | 0.044 | 0.022 | 0.015 |
| 4.649999999999776 | 0.044 | 0.022 | 0.015 |
| 4.659999999999776 | 0.044 | 0.022 | 0.015 |
| 4.669999999999776 | 0.044 | 0.022 | 0.015 |
| 4.679999999999775 | 0.044 | 0.022 | 0.015 |
| 4.689999999999775 | 0.043 | 0.022 | 0.014 |
| 4.699999999999775 | 0.043 | 0.022 | 0.014 |
| 4.709999999999775 | 0.043 | 0.022 | 0.014 |
| 4.719999999999774 | 0.043 | 0.021 | 0.014 |
| 4.729999999999774 | 0.043 | 0.021 | 0.014 |
| 4.739999999999774 | 0.043 | 0.021 | 0.014 |
| 4.749999999999774 | 0.042 | 0.021 | 0.014 |
| 4.759999999999774 | 0.042 | 0.021 | 0.014 |
| 4.769999999999774 | 0.042 | 0.021 | 0.014 |
| 4.779999999999773 | 0.042 | 0.021 | 0.014 |
| 4.789999999999773 | 0.042 | 0.021 | 0.014 |
| 4.799999999999773 | 0.042 | 0.021 | 0.014 |
| 4.809999999999773 | 0.041 | 0.021 | 0.014 |
| 4.819999999999773 | 0.041 | 0.021 | 0.014 |
| 4.829999999999773 | 0.041 | 0.021 | 0.014 |
| 4.839999999999772 | 0.041 | 0.02 | 0.014 |
| 4.849999999999772 | 0.041 | 0.02 | 0.014 |
| 4.859999999999772 | 0.041 | 0.02 | 0.014 |
| 4.869999999999772 | 0.04 | 0.02 | 0.013 |
| 4.879999999999771 | 0.04 | 0.02 | 0.013 |
| 4.889999999999771 | 0.04 | 0.02 | 0.013 |
| 4.899999999999771 | 0.04 | 0.02 | 0.013 |
| 4.90999999999977 | 0.04 | 0.02 | 0.013 |
| 4.91999999999977 | 0.04 | 0.02 | 0.013 |
| 4.92999999999977 | 0.04 | 0.02 | 0.013 |
| 4.93999999999977 | 0.039 | 0.02 | 0.013 |
| 4.94999999999977 | 0.039 | 0.02 | 0.013 |
| 4.95999999999977 | 0.039 | 0.02 | 0.013 |
| 4.96999999999977 | 0.039 | 0.019 | 0.013 |
| 4.97999999999977 | 0.039 | 0.019 | 0.013 |
| 4.98999999999977 | 0.039 | 0.019 | 0.013 |
| 4.99999999999977 | 0.038 | 0.019 | 0.013 |
| 5.009999999999768 | 0.038 | 0.019 | 0.013 |
| 5.019999999999768 | 0.038 | 0.019 | 0.013 |
| 5.029999999999768 | 0.038 | 0.019 | 0.013 |
| 5.039999999999768 | 0.038 | 0.019 | 0.013 |
| 5.049999999999767 | 0.038 | 0.019 | 0.013 |
| 5.059999999999767 | 0.038 | 0.019 | 0.013 |
| 5.069999999999767 | 0.037 | 0.019 | 0.012 |
| 5.079999999999767 | 0.037 | 0.019 | 0.012 |
| 5.089999999999767 | 0.037 | 0.019 | 0.012 |
| 5.099999999999766 | 0.037 | 0.019 | 0.012 |
| 5.109999999999766 | 0.037 | 0.018 | 0.012 |
| 5.119999999999766 | 0.037 | 0.018 | 0.012 |
| 5.129999999999766 | 0.037 | 0.018 | 0.012 |
| 5.139999999999766 | 0.036 | 0.018 | 0.012 |
| 5.149999999999765 | 0.036 | 0.018 | 0.012 |
| 5.159999999999765 | 0.036 | 0.018 | 0.012 |
| 5.169999999999765 | 0.036 | 0.018 | 0.012 |
| 5.179999999999765 | 0.036 | 0.018 | 0.012 |
| 5.189999999999764 | 0.036 | 0.018 | 0.012 |
| 5.199999999999764 | 0.036 | 0.018 | 0.012 |
| 5.209999999999764 | 0.036 | 0.018 | 0.012 |
| 5.219999999999764 | 0.035 | 0.018 | 0.012 |
| 5.229999999999764 | 0.035 | 0.018 | 0.012 |
| 5.239999999999763 | 0.035 | 0.018 | 0.012 |
| 5.249999999999763 | 0.035 | 0.018 | 0.012 |
| 5.259999999999763 | 0.035 | 0.017 | 0.012 |
| 5.269999999999763 | 0.035 | 0.017 | 0.012 |
| 5.279999999999763 | 0.035 | 0.017 | 0.012 |
| 5.289999999999762 | 0.035 | 0.017 | 0.012 |
| 5.299999999999762 | 0.034 | 0.017 | 0.011 |
| 5.309999999999762 | 0.034 | 0.017 | 0.011 |
| 5.319999999999762 | 0.034 | 0.017 | 0.011 |
| 5.329999999999762 | 0.034 | 0.017 | 0.011 |
| 5.339999999999761 | 0.034 | 0.017 | 0.011 |
| 5.349999999999761 | 0.034 | 0.017 | 0.011 |
| 5.359999999999761 | 0.034 | 0.017 | 0.011 |
| 5.369999999999761 | 0.034 | 0.017 | 0.011 |
| 5.37999999999976 | 0.033 | 0.017 | 0.011 |
| 5.38999999999976 | 0.033 | 0.017 | 0.011 |
| 5.39999999999976 | 0.033 | 0.017 | 0.011 |
| 5.40999999999976 | 0.033 | 0.017 | 0.011 |
| 5.41999999999976 | 0.033 | 0.016 | 0.011 |
| 5.42999999999976 | 0.033 | 0.016 | 0.011 |
| 5.43999999999976 | 0.033 | 0.016 | 0.011 |
| 5.44999999999976 | 0.033 | 0.016 | 0.011 |
| 5.45999999999976 | 0.032 | 0.016 | 0.011 |
| 5.46999999999976 | 0.032 | 0.016 | 0.011 |
| 5.479999999999758 | 0.032 | 0.016 | 0.011 |
| 5.489999999999758 | 0.032 | 0.016 | 0.011 |
| 5.499999999999758 | 0.032 | 0.016 | 0.011 |
| 5.509999999999758 | 0.032 | 0.016 | 0.011 |
| 5.519999999999758 | 0.032 | 0.016 | 0.011 |
| 5.529999999999758 | 0.032 | 0.016 | 0.011 |
| 5.539999999999757 | 0.032 | 0.016 | 0.011 |
| 5.549999999999757 | 0.031 | 0.016 | 0.01 |
| 5.559999999999757 | 0.031 | 0.016 | 0.01 |
| 5.569999999999757 | 0.031 | 0.016 | 0.01 |
| 5.579999999999756 | 0.031 | 0.016 | 0.01 |
| 5.589999999999756 | 0.031 | 0.016 | 0.01 |
| 5.599999999999756 | 0.031 | 0.015 | 0.01 |
| 5.609999999999756 | 0.031 | 0.015 | 0.01 |
| 5.619999999999756 | 0.031 | 0.015 | 0.01 |
| 5.629999999999756 | 0.031 | 0.015 | 0.01 |
| 5.639999999999755 | 0.03 | 0.015 | 0.01 |
| 5.649999999999755 | 0.03 | 0.015 | 0.01 |
| 5.659999999999755 | 0.03 | 0.015 | 0.01 |
| 5.669999999999755 | 0.03 | 0.015 | 0.01 |
| 5.679999999999754 | 0.03 | 0.015 | 0.01 |
| 5.689999999999754 | 0.03 | 0.015 | 0.01 |
| 5.699999999999754 | 0.03 | 0.015 | 0.01 |
| 5.709999999999754 | 0.03 | 0.015 | 0.01 |
| 5.719999999999754 | 0.03 | 0.015 | 0.01 |
| 5.729999999999753 | 0.03 | 0.015 | 0.01 |
| 5.739999999999753 | 0.029 | 0.015 | 0.01 |
| 5.749999999999753 | 0.029 | 0.015 | 0.01 |
| 5.759999999999753 | 0.029 | 0.015 | 0.01 |
| 5.769999999999753 | 0.029 | 0.015 | 0.01 |
| 5.779999999999752 | 0.029 | 0.015 | 0.01 |
| 5.789999999999752 | 0.029 | 0.014 | 0.01 |
| 5.799999999999752 | 0.029 | 0.014 | 0.01 |
| 5.809999999999752 | 0.029 | 0.014 | 0.01 |
| 5.819999999999752 | 0.029 | 0.014 | 0.01 |
| 5.829999999999751 | 0.029 | 0.014 | 0.01 |
| 5.839999999999751 | 0.028 | 0.014 | 0.009 |
| 5.849999999999751 | 0.028 | 0.014 | 0.009 |
| 5.859999999999751 | 0.028 | 0.014 | 0.009 |
| 5.86999999999975 | 0.028 | 0.014 | 0.009 |
| 5.87999999999975 | 0.028 | 0.014 | 0.009 |
| 5.88999999999975 | 0.028 | 0.014 | 0.009 |
| 5.89999999999975 | 0.028 | 0.014 | 0.009 |
| 5.90999999999975 | 0.028 | 0.014 | 0.009 |
| 5.91999999999975 | 0.028 | 0.014 | 0.009 |
| 5.92999999999975 | 0.028 | 0.014 | 0.009 |
| 5.93999999999975 | 0.028 | 0.014 | 0.009 |
| 5.949999999999748 | 0.027 | 0.014 | 0.009 |
| 5.959999999999748 | 0.027 | 0.014 | 0.009 |
| 5.969999999999748 | 0.027 | 0.014 | 0.009 |
| 5.979999999999748 | 0.027 | 0.014 | 0.009 |
| 5.989999999999747 | 0.027 | 0.014 | 0.009 |
| 5.999999999999747 | 0.027 | 0.014 | 0.009 |
| 6.009999999999747 | 0.027 | 0.013 | 0.009 |
| 6.019999999999747 | 0.027 | 0.013 | 0.009 |
| 6.029999999999747 | 0.027 | 0.013 | 0.009 |
| 6.039999999999746 | 0.027 | 0.013 | 0.009 |
| 6.049999999999746 | 0.027 | 0.013 | 0.009 |
| 6.059999999999746 | 0.027 | 0.013 | 0.009 |
| 6.069999999999746 | 0.026 | 0.013 | 0.009 |
| 6.079999999999746 | 0.026 | 0.013 | 0.009 |
| 6.089999999999745 | 0.026 | 0.013 | 0.009 |
| 6.099999999999745 | 0.026 | 0.013 | 0.009 |
| 6.109999999999745 | 0.026 | 0.013 | 0.009 |
| 6.119999999999745 | 0.026 | 0.013 | 0.009 |
| 6.129999999999745 | 0.026 | 0.013 | 0.009 |
| 6.139999999999744 | 0.026 | 0.013 | 0.009 |
| 6.149999999999744 | 0.026 | 0.013 | 0.009 |
| 6.159999999999744 | 0.026 | 0.013 | 0.009 |
| 6.169999999999744 | 0.026 | 0.013 | 0.009 |
| 6.179999999999744 | 0.026 | 0.013 | 0.009 |
| 6.189999999999744 | 0.025 | 0.013 | 0.008 |
| 6.199999999999743 | 0.025 | 0.013 | 0.008 |
| 6.209999999999743 | 0.025 | 0.013 | 0.008 |
| 6.219999999999743 | 0.025 | 0.013 | 0.008 |
| 6.229999999999743 | 0.025 | 0.013 | 0.008 |
| 6.239999999999742 | 0.025 | 0.013 | 0.008 |
| 6.249999999999742 | 0.025 | 0.012 | 0.008 |
| 6.259999999999742 | 0.025 | 0.012 | 0.008 |
| 6.269999999999742 | 0.025 | 0.012 | 0.008 |
| 6.279999999999741 | 0.025 | 0.012 | 0.008 |
| 6.289999999999741 | 0.025 | 0.012 | 0.008 |
| 6.299999999999741 | 0.025 | 0.012 | 0.008 |
| 6.309999999999741 | 0.025 | 0.012 | 0.008 |
| 6.319999999999741 | 0.024 | 0.012 | 0.008 |
| 6.329999999999741 | 0.024 | 0.012 | 0.008 |
| 6.33999999999974 | 0.024 | 0.012 | 0.008 |
| 6.34999999999974 | 0.024 | 0.012 | 0.008 |
| 6.35999999999974 | 0.024 | 0.012 | 0.008 |
| 6.36999999999974 | 0.024 | 0.012 | 0.008 |
| 6.37999999999974 | 0.024 | 0.012 | 0.008 |
| 6.38999999999974 | 0.024 | 0.012 | 0.008 |
| 6.39999999999974 | 0.024 | 0.012 | 0.008 |
| 6.409999999999738 | 0.024 | 0.012 | 0.008 |
| 6.419999999999738 | 0.024 | 0.012 | 0.008 |
| 6.429999999999738 | 0.024 | 0.012 | 0.008 |
| 6.439999999999738 | 0.024 | 0.012 | 0.008 |
| 6.449999999999738 | 0.023 | 0.012 | 0.008 |
| 6.459999999999737 | 0.023 | 0.012 | 0.008 |
| 6.469999999999737 | 0.023 | 0.012 | 0.008 |
| 6.479999999999737 | 0.023 | 0.012 | 0.008 |
| 6.489999999999737 | 0.023 | 0.012 | 0.008 |
| 6.499999999999737 | 0.023 | 0.012 | 0.008 |
| 6.509999999999736 | 0.023 | 0.012 | 0.008 |
| 6.519999999999736 | 0.023 | 0.011 | 0.008 |
| 6.529999999999736 | 0.023 | 0.011 | 0.008 |
| 6.539999999999736 | 0.023 | 0.011 | 0.008 |
| 6.549999999999736 | 0.023 | 0.011 | 0.008 |
| 6.559999999999735 | 0.023 | 0.011 | 0.008 |
| 6.569999999999735 | 0.023 | 0.011 | 0.008 |
| 6.579999999999735 | 0.023 | 0.011 | 0.008 |
| 6.589999999999735 | 0.023 | 0.011 | 0.008 |
| 6.599999999999734 | 0.022 | 0.011 | 0.007 |
| 6.609999999999734 | 0.022 | 0.011 | 0.007 |
| 6.619999999999734 | 0.022 | 0.011 | 0.007 |
| 6.629999999999734 | 0.022 | 0.011 | 0.007 |
| 6.639999999999734 | 0.022 | 0.011 | 0.007 |
| 6.649999999999734 | 0.022 | 0.011 | 0.007 |
| 6.659999999999734 | 0.022 | 0.011 | 0.007 |
| 6.669999999999733 | 0.022 | 0.011 | 0.007 |
| 6.679999999999733 | 0.022 | 0.011 | 0.007 |
| 6.689999999999733 | 0.022 | 0.011 | 0.007 |
| 6.699999999999733 | 0.022 | 0.011 | 0.007 |
| 6.709999999999732 | 0.022 | 0.011 | 0.007 |
| 6.719999999999732 | 0.022 | 0.011 | 0.007 |
| 6.729999999999732 | 0.022 | 0.011 | 0.007 |
| 6.739999999999731 | 0.022 | 0.011 | 0.007 |
| 6.749999999999731 | 0.021 | 0.011 | 0.007 |
| 6.759999999999731 | 0.021 | 0.011 | 0.007 |
| 6.769999999999731 | 0.021 | 0.011 | 0.007 |
| 6.77999999999973 | 0.021 | 0.011 | 0.007 |
| 6.78999999999973 | 0.021 | 0.011 | 0.007 |
| 6.79999999999973 | 0.021 | 0.011 | 0.007 |
| 6.80999999999973 | 0.021 | 0.011 | 0.007 |
| 6.81999999999973 | 0.021 | 0.011 | 0.007 |
| 6.82999999999973 | 0.021 | 0.01 | 0.007 |
| 6.83999999999973 | 0.021 | 0.01 | 0.007 |
| 6.84999999999973 | 0.021 | 0.01 | 0.007 |
| 6.85999999999973 | 0.021 | 0.01 | 0.007 |
| 6.86999999999973 | 0.021 | 0.01 | 0.007 |
| 6.879999999999728 | 0.021 | 0.01 | 0.007 |
| 6.889999999999728 | 0.021 | 0.01 | 0.007 |
| 6.899999999999728 | 0.021 | 0.01 | 0.007 |
| 6.909999999999728 | 0.021 | 0.01 | 0.007 |
| 6.919999999999728 | 0.02 | 0.01 | 0.007 |
| 6.929999999999727 | 0.02 | 0.01 | 0.007 |
| 6.939999999999727 | 0.02 | 0.01 | 0.007 |
| 6.949999999999727 | 0.02 | 0.01 | 0.007 |
| 6.959999999999727 | 0.02 | 0.01 | 0.007 |
| 6.969999999999727 | 0.02 | 0.01 | 0.007 |
| 6.979999999999726 | 0.02 | 0.01 | 0.007 |
| 6.989999999999726 | 0.02 | 0.01 | 0.007 |
| 6.999999999999726 | 0.02 | 0.01 | 0.007 |
| 7.009999999999726 | 0.02 | 0.01 | 0.007 |
| 7.019999999999726 | 0.02 | 0.01 | 0.007 |
| 7.029999999999725 | 0.02 | 0.01 | 0.007 |
| 7.039999999999725 | 0.02 | 0.01 | 0.007 |
| 7.049999999999725 | 0.02 | 0.01 | 0.007 |
| 7.059999999999725 | 0.02 | 0.01 | 0.007 |
| 7.069999999999724 | 0.02 | 0.01 | 0.007 |
| 7.079999999999724 | 0.02 | 0.01 | 0.007 |
| 7.089999999999724 | 0.02 | 0.01 | 0.007 |
| 7.099999999999724 | 0.019 | 0.01 | 0.006 |
| 7.109999999999724 | 0.019 | 0.01 | 0.006 |
| 7.119999999999724 | 0.019 | 0.01 | 0.006 |
| 7.129999999999724 | 0.019 | 0.01 | 0.006 |
| 7.139999999999723 | 0.019 | 0.01 | 0.006 |
| 7.149999999999723 | 0.019 | 0.01 | 0.006 |
| 7.159999999999723 | 0.019 | 0.01 | 0.006 |
| 7.169999999999723 | 0.019 | 0.01 | 0.006 |
| 7.179999999999722 | 0.019 | 0.01 | 0.006 |
| 7.189999999999722 | 0.019 | 0.009 | 0.006 |
| 7.199999999999722 | 0.019 | 0.009 | 0.006 |
| 7.209999999999721 | 0.019 | 0.009 | 0.006 |
| 7.219999999999721 | 0.019 | 0.009 | 0.006 |
| 7.229999999999721 | 0.019 | 0.009 | 0.006 |
| 7.23999999999972 | 0.019 | 0.009 | 0.006 |
| 7.24999999999972 | 0.019 | 0.009 | 0.006 |
| 7.25999999999972 | 0.019 | 0.009 | 0.006 |
| 7.26999999999972 | 0.019 | 0.009 | 0.006 |
| 7.27999999999972 | 0.019 | 0.009 | 0.006 |
| 7.28999999999972 | 0.018 | 0.009 | 0.006 |
| 7.29999999999972 | 0.018 | 0.009 | 0.006 |
| 7.30999999999972 | 0.018 | 0.009 | 0.006 |
| 7.31999999999972 | 0.018 | 0.009 | 0.006 |
| 7.329999999999719 | 0.018 | 0.009 | 0.006 |
| 7.33999999999972 | 0.018 | 0.009 | 0.006 |
| 7.349999999999719 | 0.018 | 0.009 | 0.006 |
| 7.359999999999719 | 0.018 | 0.009 | 0.006 |
| 7.369999999999718 | 0.018 | 0.009 | 0.006 |
| 7.379999999999718 | 0.018 | 0.009 | 0.006 |
| 7.389999999999718 | 0.018 | 0.009 | 0.006 |
| 7.399999999999718 | 0.018 | 0.009 | 0.006 |
| 7.409999999999717 | 0.018 | 0.009 | 0.006 |
| 7.419999999999717 | 0.018 | 0.009 | 0.006 |
| 7.429999999999717 | 0.018 | 0.009 | 0.006 |
| 7.439999999999717 | 0.018 | 0.009 | 0.006 |
| 7.449999999999716 | 0.018 | 0.009 | 0.006 |
| 7.459999999999716 | 0.018 | 0.009 | 0.006 |
| 7.469999999999716 | 0.018 | 0.009 | 0.006 |
| 7.479999999999716 | 0.018 | 0.009 | 0.006 |
| 7.489999999999715 | 0.018 | 0.009 | 0.006 |
| 7.499999999999715 | 0.017 | 0.009 | 0.006 |
| 7.509999999999715 | 0.017 | 0.009 | 0.006 |
| 7.519999999999715 | 0.017 | 0.009 | 0.006 |
| 7.529999999999715 | 0.017 | 0.009 | 0.006 |
| 7.539999999999714 | 0.017 | 0.009 | 0.006 |
| 7.549999999999714 | 0.017 | 0.009 | 0.006 |
| 7.559999999999714 | 0.017 | 0.009 | 0.006 |
| 7.569999999999714 | 0.017 | 0.009 | 0.006 |
| 7.579999999999714 | 0.017 | 0.009 | 0.006 |
| 7.589999999999714 | 0.017 | 0.009 | 0.006 |
| 7.599999999999714 | 0.017 | 0.009 | 0.006 |
| 7.609999999999713 | 0.017 | 0.008 | 0.006 |
| 7.619999999999713 | 0.017 | 0.008 | 0.006 |
| 7.629999999999713 | 0.017 | 0.008 | 0.006 |
| 7.639999999999713 | 0.017 | 0.008 | 0.006 |
| 7.649999999999712 | 0.017 | 0.008 | 0.006 |
| 7.659999999999712 | 0.017 | 0.008 | 0.006 |
| 7.669999999999712 | 0.017 | 0.008 | 0.006 |
| 7.679999999999712 | 0.017 | 0.008 | 0.006 |
| 7.689999999999712 | 0.017 | 0.008 | 0.006 |
| 7.699999999999711 | 0.017 | 0.008 | 0.006 |
| 7.709999999999711 | 0.017 | 0.008 | 0.006 |
| 7.719999999999711 | 0.017 | 0.008 | 0.006 |
| 7.729999999999711 | 0.016 | 0.008 | 0.005 |
| 7.73999999999971 | 0.016 | 0.008 | 0.005 |
| 7.74999999999971 | 0.016 | 0.008 | 0.005 |
| 7.75999999999971 | 0.016 | 0.008 | 0.005 |
| 7.76999999999971 | 0.016 | 0.008 | 0.005 |
| 7.77999999999971 | 0.016 | 0.008 | 0.005 |
| 7.78999999999971 | 0.016 | 0.008 | 0.005 |
| 7.79999999999971 | 0.016 | 0.008 | 0.005 |
| 7.80999999999971 | 0.016 | 0.008 | 0.005 |
| 7.819999999999709 | 0.016 | 0.008 | 0.005 |
| 7.829999999999709 | 0.016 | 0.008 | 0.005 |
| 7.839999999999708 | 0.016 | 0.008 | 0.005 |
| 7.849999999999708 | 0.016 | 0.008 | 0.005 |
| 7.859999999999708 | 0.016 | 0.008 | 0.005 |
| 7.869999999999708 | 0.016 | 0.008 | 0.005 |
| 7.879999999999707 | 0.016 | 0.008 | 0.005 |
| 7.889999999999707 | 0.016 | 0.008 | 0.005 |
| 7.899999999999707 | 0.016 | 0.008 | 0.005 |
| 7.909999999999707 | 0.016 | 0.008 | 0.005 |
| 7.919999999999706 | 0.016 | 0.008 | 0.005 |
| 7.929999999999706 | 0.016 | 0.008 | 0.005 |
| 7.939999999999706 | 0.016 | 0.008 | 0.005 |
| 7.949999999999706 | 0.016 | 0.008 | 0.005 |
| 7.959999999999705 | 0.016 | 0.008 | 0.005 |
| 7.969999999999705 | 0.015 | 0.008 | 0.005 |
| 7.979999999999705 | 0.015 | 0.008 | 0.005 |
| 7.989999999999705 | 0.015 | 0.008 | 0.005 |
| 7.999999999999705 | 0.015 | 0.008 | 0.005 |
| 8.009999999999703 | 0.015 | 0.008 | 0.005 |
| 8.019999999999705 | 0.015 | 0.008 | 0.005 |
| 8.029999999999704 | 0.015 | 0.008 | 0.005 |
| 8.039999999999704 | 0.015 | 0.008 | 0.005 |
| 8.049999999999704 | 0.015 | 0.008 | 0.005 |
| 8.059999999999704 | 0.015 | 0.008 | 0.005 |
| 8.069999999999704 | 0.015 | 0.008 | 0.005 |
| 8.079999999999703 | 0.015 | 0.008 | 0.005 |
| 8.089999999999703 | 0.015 | 0.008 | 0.005 |
| 8.099999999999701 | 0.015 | 0.008 | 0.005 |
| 8.109999999999703 | 0.015 | 0.007 | 0.005 |
| 8.119999999999703 | 0.015 | 0.007 | 0.005 |
| 8.129999999999702 | 0.015 | 0.007 | 0.005 |
| 8.139999999999702 | 0.015 | 0.007 | 0.005 |
| 8.1499999999997 | 0.015 | 0.007 | 0.005 |
| 8.1599999999997 | 0.015 | 0.007 | 0.005 |
| 8.1699999999997 | 0.015 | 0.007 | 0.005 |
| 8.1799999999997 | 0.015 | 0.007 | 0.005 |
| 8.1899999999997 | 0.015 | 0.007 | 0.005 |
| 8.1999999999997 | 0.015 | 0.007 | 0.005 |
| 8.2099999999997 | 0.015 | 0.007 | 0.005 |
| 8.2199999999997 | 0.015 | 0.007 | 0.005 |
| 8.2299999999997 | 0.015 | 0.007 | 0.005 |
| 8.2399999999997 | 0.015 | 0.007 | 0.005 |
| 8.2499999999997 | 0.014 | 0.007 | 0.005 |
| 8.2599999999997 | 0.014 | 0.007 | 0.005 |
| 8.2699999999997 | 0.014 | 0.007 | 0.005 |
| 8.2799999999997 | 0.014 | 0.007 | 0.005 |
| 8.289999999999697 | 0.014 | 0.007 | 0.005 |
| 8.299999999999699 | 0.014 | 0.007 | 0.005 |
| 8.309999999999699 | 0.014 | 0.007 | 0.005 |
| 8.319999999999698 | 0.014 | 0.007 | 0.005 |
| 8.329999999999698 | 0.014 | 0.007 | 0.005 |
| 8.339999999999698 | 0.014 | 0.007 | 0.005 |
| 8.349999999999698 | 0.014 | 0.007 | 0.005 |
| 8.359999999999697 | 0.014 | 0.007 | 0.005 |
| 8.369999999999697 | 0.014 | 0.007 | 0.005 |
| 8.379999999999695 | 0.014 | 0.007 | 0.005 |
| 8.389999999999697 | 0.014 | 0.007 | 0.005 |
| 8.399999999999697 | 0.014 | 0.007 | 0.005 |
| 8.409999999999696 | 0.014 | 0.007 | 0.005 |
| 8.419999999999696 | 0.014 | 0.007 | 0.005 |
| 8.429999999999694 | 0.014 | 0.007 | 0.005 |
| 8.439999999999696 | 0.014 | 0.007 | 0.005 |
| 8.449999999999696 | 0.014 | 0.007 | 0.005 |
| 8.459999999999695 | 0.014 | 0.007 | 0.005 |
| 8.469999999999695 | 0.014 | 0.007 | 0.005 |
| 8.479999999999693 | 0.014 | 0.007 | 0.005 |
| 8.489999999999695 | 0.014 | 0.007 | 0.005 |
| 8.499999999999694 | 0.014 | 0.007 | 0.005 |
| 8.509999999999694 | 0.014 | 0.007 | 0.005 |
| 8.519999999999694 | 0.014 | 0.007 | 0.005 |
| 8.529999999999694 | 0.014 | 0.007 | 0.005 |
| 8.539999999999694 | 0.014 | 0.007 | 0.005 |
| 8.549999999999693 | 0.013 | 0.007 | 0.004 |
| 8.55999999999969 | 0.013 | 0.007 | 0.004 |
| 8.56999999999969 | 0.013 | 0.007 | 0.004 |
| 8.57999999999969 | 0.013 | 0.007 | 0.004 |
| 8.58999999999969 | 0.013 | 0.007 | 0.004 |
| 8.59999999999969 | 0.013 | 0.007 | 0.004 |
| 8.60999999999969 | 0.013 | 0.007 | 0.004 |
| 8.61999999999969 | 0.013 | 0.007 | 0.004 |
| 8.62999999999969 | 0.013 | 0.007 | 0.004 |
| 8.63999999999969 | 0.013 | 0.007 | 0.004 |
| 8.64999999999969 | 0.013 | 0.007 | 0.004 |
| 8.65999999999969 | 0.013 | 0.007 | 0.004 |
| 8.66999999999969 | 0.013 | 0.007 | 0.004 |
| 8.67999999999969 | 0.013 | 0.007 | 0.004 |
| 8.68999999999969 | 0.013 | 0.007 | 0.004 |
| 8.69999999999969 | 0.013 | 0.007 | 0.004 |
| 8.70999999999969 | 0.013 | 0.007 | 0.004 |
| 8.71999999999969 | 0.013 | 0.006 | 0.004 |
| 8.72999999999969 | 0.013 | 0.006 | 0.004 |
| 8.73999999999969 | 0.013 | 0.006 | 0.004 |
| 8.74999999999969 | 0.013 | 0.006 | 0.004 |
| 8.759999999999687 | 0.013 | 0.006 | 0.004 |
| 8.769999999999689 | 0.013 | 0.006 | 0.004 |
| 8.779999999999688 | 0.013 | 0.006 | 0.004 |
| 8.789999999999688 | 0.013 | 0.006 | 0.004 |
| 8.799999999999686 | 0.013 | 0.006 | 0.004 |
| 8.809999999999688 | 0.013 | 0.006 | 0.004 |
| 8.819999999999688 | 0.013 | 0.006 | 0.004 |
| 8.829999999999687 | 0.013 | 0.006 | 0.004 |
| 8.839999999999687 | 0.013 | 0.006 | 0.004 |
| 8.849999999999685 | 0.013 | 0.006 | 0.004 |
| 8.859999999999687 | 0.013 | 0.006 | 0.004 |
| 8.869999999999687 | 0.013 | 0.006 | 0.004 |
| 8.879999999999686 | 0.013 | 0.006 | 0.004 |
| 8.889999999999686 | 0.012 | 0.006 | 0.004 |
| 8.899999999999684 | 0.012 | 0.006 | 0.004 |
| 8.909999999999686 | 0.012 | 0.006 | 0.004 |
| 8.919999999999686 | 0.012 | 0.006 | 0.004 |
| 8.929999999999685 | 0.012 | 0.006 | 0.004 |
| 8.939999999999685 | 0.012 | 0.006 | 0.004 |
| 8.949999999999685 | 0.012 | 0.006 | 0.004 |
| 8.959999999999685 | 0.012 | 0.006 | 0.004 |
| 8.969999999999684 | 0.012 | 0.006 | 0.004 |
| 8.979999999999684 | 0.012 | 0.006 | 0.004 |
| 8.989999999999682 | 0.012 | 0.006 | 0.004 |
| 8.999999999999684 | 0.012 | 0.006 | 0.004 |
| 9.009999999999684 | 0.012 | 0.006 | 0.004 |
| 9.019999999999683 | 0.012 | 0.006 | 0.004 |
| 9.029999999999683 | 0.012 | 0.006 | 0.004 |
| 9.039999999999681 | 0.012 | 0.006 | 0.004 |
| 9.049999999999683 | 0.012 | 0.006 | 0.004 |
| 9.05999999999968 | 0.012 | 0.006 | 0.004 |
| 9.06999999999968 | 0.012 | 0.006 | 0.004 |
| 9.07999999999968 | 0.012 | 0.006 | 0.004 |
| 9.08999999999968 | 0.012 | 0.006 | 0.004 |
| 9.09999999999968 | 0.012 | 0.006 | 0.004 |
| 9.10999999999968 | 0.012 | 0.006 | 0.004 |
| 9.11999999999968 | 0.012 | 0.006 | 0.004 |
| 9.12999999999968 | 0.012 | 0.006 | 0.004 |
| 9.13999999999968 | 0.012 | 0.006 | 0.004 |
| 9.14999999999968 | 0.012 | 0.006 | 0.004 |
| 9.15999999999968 | 0.012 | 0.006 | 0.004 |
| 9.16999999999968 | 0.012 | 0.006 | 0.004 |
| 9.17999999999968 | 0.012 | 0.006 | 0.004 |
| 9.18999999999968 | 0.012 | 0.006 | 0.004 |
| 9.19999999999968 | 0.012 | 0.006 | 0.004 |
| 9.20999999999968 | 0.012 | 0.006 | 0.004 |
| 9.21999999999968 | 0.012 | 0.006 | 0.004 |
| 9.229999999999677 | 0.012 | 0.006 | 0.004 |
| 9.239999999999679 | 0.012 | 0.006 | 0.004 |
| 9.249999999999678 | 0.012 | 0.006 | 0.004 |
| 9.259999999999678 | 0.012 | 0.006 | 0.004 |
| 9.269999999999678 | 0.012 | 0.006 | 0.004 |
| 9.279999999999678 | 0.011 | 0.006 | 0.004 |
| 9.289999999999678 | 0.011 | 0.006 | 0.004 |
| 9.299999999999677 | 0.011 | 0.006 | 0.004 |
| 9.309999999999677 | 0.011 | 0.006 | 0.004 |
| 9.319999999999675 | 0.011 | 0.006 | 0.004 |
| 9.329999999999677 | 0.011 | 0.006 | 0.004 |
| 9.339999999999677 | 0.011 | 0.006 | 0.004 |
| 9.349999999999676 | 0.011 | 0.006 | 0.004 |
| 9.359999999999676 | 0.011 | 0.006 | 0.004 |
| 9.369999999999674 | 0.011 | 0.006 | 0.004 |
| 9.379999999999676 | 0.011 | 0.006 | 0.004 |
| 9.389999999999675 | 0.011 | 0.006 | 0.004 |
| 9.399999999999675 | 0.011 | 0.006 | 0.004 |
| 9.409999999999675 | 0.011 | 0.006 | 0.004 |
| 9.419999999999675 | 0.011 | 0.006 | 0.004 |
| 9.429999999999675 | 0.011 | 0.006 | 0.004 |
| 9.439999999999674 | 0.011 | 0.006 | 0.004 |
| 9.449999999999674 | 0.011 | 0.006 | 0.004 |
| 9.459999999999672 | 0.011 | 0.006 | 0.004 |
| 9.469999999999674 | 0.011 | 0.006 | 0.004 |
| 9.479999999999674 | 0.011 | 0.006 | 0.004 |
| 9.489999999999673 | 0.011 | 0.005 | 0.004 |
| 9.499999999999673 | 0.011 | 0.005 | 0.004 |
| 9.509999999999671 | 0.011 | 0.005 | 0.004 |
| 9.519999999999673 | 0.011 | 0.005 | 0.004 |
| 9.529999999999673 | 0.011 | 0.005 | 0.004 |
| 9.539999999999672 | 0.011 | 0.005 | 0.004 |
| 9.549999999999672 | 0.011 | 0.005 | 0.004 |
| 9.55999999999967 | 0.011 | 0.005 | 0.004 |
| 9.56999999999967 | 0.011 | 0.005 | 0.004 |
| 9.57999999999967 | 0.011 | 0.005 | 0.004 |
| 9.58999999999967 | 0.011 | 0.005 | 0.004 |
| 9.59999999999967 | 0.011 | 0.005 | 0.004 |
| 9.60999999999967 | 0.011 | 0.005 | 0.004 |
| 9.61999999999967 | 0.011 | 0.005 | 0.004 |
| 9.62999999999967 | 0.011 | 0.005 | 0.004 |
| 9.63999999999967 | 0.011 | 0.005 | 0.004 |
| 9.64999999999967 | 0.011 | 0.005 | 0.004 |
| 9.65999999999967 | 0.011 | 0.005 | 0.004 |
| 9.66999999999967 | 0.011 | 0.005 | 0.004 |
| 9.67999999999967 | 0.011 | 0.005 | 0.004 |
| 9.689999999999667 | 0.011 | 0.005 | 0.004 |
| 9.699999999999669 | 0.011 | 0.005 | 0.004 |
| 9.709999999999669 | 0.01 | 0.005 | 0.003 |
| 9.719999999999668 | 0.01 | 0.005 | 0.003 |
| 9.729999999999668 | 0.01 | 0.005 | 0.003 |
| 9.739999999999666 | 0.01 | 0.005 | 0.003 |
| 9.749999999999668 | 0.01 | 0.005 | 0.003 |
| 9.759999999999668 | 0.01 | 0.005 | 0.003 |
| 9.769999999999667 | 0.01 | 0.005 | 0.003 |
| 9.779999999999667 | 0.01 | 0.005 | 0.003 |
| 9.789999999999665 | 0.01 | 0.005 | 0.003 |
| 9.799999999999667 | 0.01 | 0.005 | 0.003 |
| 9.809999999999667 | 0.01 | 0.005 | 0.003 |
| 9.819999999999666 | 0.01 | 0.005 | 0.003 |
| 9.829999999999666 | 0.01 | 0.005 | 0.003 |
| 9.839999999999664 | 0.01 | 0.005 | 0.003 |
| 9.849999999999666 | 0.01 | 0.005 | 0.003 |
| 9.859999999999665 | 0.01 | 0.005 | 0.003 |
| 9.869999999999665 | 0.01 | 0.005 | 0.003 |
| 9.879999999999663 | 0.01 | 0.005 | 0.003 |
| 9.889999999999665 | 0.01 | 0.005 | 0.003 |
| 9.899999999999665 | 0.01 | 0.005 | 0.003 |
| 9.909999999999664 | 0.01 | 0.005 | 0.003 |
| 9.919999999999664 | 0.01 | 0.005 | 0.003 |
| 9.929999999999662 | 0.01 | 0.005 | 0.003 |
| 9.939999999999664 | 0.01 | 0.005 | 0.003 |
| 9.949999999999664 | 0.01 | 0.005 | 0.003 |
| 9.95999999999966 | 0.01 | 0.005 | 0.003 |
| 9.96999999999966 | 0.01 | 0.005 | 0.003 |
| 9.97999999999966 | 0.01 | 0.005 | 0.003 |
| 9.98999999999966 | 0.01 | 0.005 | 0.003 |
| 9.99999999999966 | 0.01 | 0.005 | 0.003 |